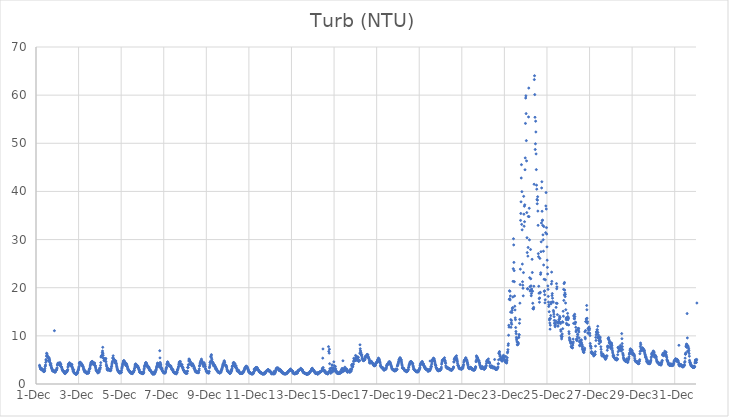
| Category | Turb (NTU) |
|---|---|
| 44896.166666666664 | 3.89 |
| 44896.177083333336 | 3.72 |
| 44896.1875 | 3.53 |
| 44896.197916666664 | 3.43 |
| 44896.208333333336 | 3.12 |
| 44896.21875 | 3.24 |
| 44896.229166666664 | 3.12 |
| 44896.239583333336 | 3.1 |
| 44896.25 | 3.03 |
| 44896.260416666664 | 3.12 |
| 44896.270833333336 | 3.23 |
| 44896.28125 | 2.91 |
| 44896.291666666664 | 2.94 |
| 44896.302083333336 | 2.89 |
| 44896.3125 | 2.82 |
| 44896.322916666664 | 2.93 |
| 44896.333333333336 | 2.72 |
| 44896.34375 | 2.73 |
| 44896.354166666664 | 2.88 |
| 44896.364583333336 | 2.58 |
| 44896.375 | 2.55 |
| 44896.385416666664 | 2.61 |
| 44896.395833333336 | 2.65 |
| 44896.40625 | 2.84 |
| 44896.416666666664 | 3.18 |
| 44896.427083333336 | 3.62 |
| 44896.4375 | 3.74 |
| 44896.447916666664 | 3.96 |
| 44896.458333333336 | 4.49 |
| 44896.46875 | 5.09 |
| 44896.479166666664 | 4.84 |
| 44896.489583333336 | 5.8 |
| 44896.5 | 6.39 |
| 44896.510416666664 | 6.29 |
| 44896.520833333336 | 6.04 |
| 44896.53125 | 5.77 |
| 44896.541666666664 | 5.73 |
| 44896.552083333336 | 5.62 |
| 44896.5625 | 5.45 |
| 44896.572916666664 | 5.65 |
| 44896.583333333336 | 4.84 |
| 44896.59375 | 4.83 |
| 44896.604166666664 | 5.42 |
| 44896.614583333336 | 4.96 |
| 44896.625 | 5.35 |
| 44896.635416666664 | 4.68 |
| 44896.645833333336 | 4.97 |
| 44896.65625 | 4.46 |
| 44896.666666666664 | 4.11 |
| 44896.677083333336 | 3.85 |
| 44896.6875 | 3.99 |
| 44896.697916666664 | 4.23 |
| 44896.708333333336 | 3.88 |
| 44896.71875 | 3.51 |
| 44896.729166666664 | 3.44 |
| 44896.739583333336 | 3.22 |
| 44896.75 | 3.14 |
| 44896.760416666664 | 2.95 |
| 44896.770833333336 | 2.77 |
| 44896.78125 | 2.76 |
| 44896.791666666664 | 2.78 |
| 44896.802083333336 | 2.67 |
| 44896.8125 | 2.68 |
| 44896.822916666664 | 2.71 |
| 44896.833333333336 | 2.61 |
| 44896.84375 | 2.66 |
| 44896.854166666664 | 2.75 |
| 44896.864583333336 | 11.07 |
| 44896.875 | 2.53 |
| 44896.885416666664 | 2.49 |
| 44896.895833333336 | 2.47 |
| 44896.90625 | 2.51 |
| 44896.916666666664 | 2.59 |
| 44896.927083333336 | 2.76 |
| 44896.9375 | 2.9 |
| 44896.947916666664 | 2.87 |
| 44896.958333333336 | 2.88 |
| 44896.96875 | 2.99 |
| 44896.979166666664 | 3.18 |
| 44896.989583333336 | 3.36 |
| 44897.0 | 3.94 |
| 44897.010416666664 | 3.99 |
| 44897.020833333336 | 4.11 |
| 44897.03125 | 4.28 |
| 44897.041666666664 | 4.37 |
| 44897.052083333336 | 4.18 |
| 44897.0625 | 4.16 |
| 44897.072916666664 | 4.28 |
| 44897.083333333336 | 4.22 |
| 44897.09375 | 4.22 |
| 44897.104166666664 | 3.89 |
| 44897.114583333336 | 4.13 |
| 44897.125 | 4.45 |
| 44897.135416666664 | 4.07 |
| 44897.145833333336 | 4 |
| 44897.15625 | 4.2 |
| 44897.166666666664 | 4.03 |
| 44897.177083333336 | 3.63 |
| 44897.1875 | 3.6 |
| 44897.197916666664 | 3.51 |
| 44897.208333333336 | 3.49 |
| 44897.21875 | 3.23 |
| 44897.229166666664 | 3.01 |
| 44897.239583333336 | 2.92 |
| 44897.25 | 2.78 |
| 44897.260416666664 | 2.73 |
| 44897.270833333336 | 2.73 |
| 44897.28125 | 2.72 |
| 44897.291666666664 | 2.7 |
| 44897.302083333336 | 2.56 |
| 44897.3125 | 2.58 |
| 44897.322916666664 | 2.41 |
| 44897.333333333336 | 2.35 |
| 44897.34375 | 2.22 |
| 44897.354166666664 | 2.29 |
| 44897.364583333336 | 2.13 |
| 44897.375 | 2.55 |
| 44897.385416666664 | 2.43 |
| 44897.395833333336 | 2.35 |
| 44897.40625 | 2.33 |
| 44897.416666666664 | 2.41 |
| 44897.427083333336 | 2.54 |
| 44897.4375 | 2.55 |
| 44897.447916666664 | 2.65 |
| 44897.458333333336 | 2.57 |
| 44897.46875 | 2.8 |
| 44897.479166666664 | 2.84 |
| 44897.489583333336 | 3 |
| 44897.5 | 3.51 |
| 44897.510416666664 | 3.7 |
| 44897.520833333336 | 4.03 |
| 44897.53125 | 4.15 |
| 44897.541666666664 | 4.15 |
| 44897.552083333336 | 4.23 |
| 44897.5625 | 4.07 |
| 44897.572916666664 | 4.43 |
| 44897.583333333336 | 4.02 |
| 44897.59375 | 4.09 |
| 44897.604166666664 | 4.05 |
| 44897.614583333336 | 3.95 |
| 44897.625 | 3.81 |
| 44897.635416666664 | 4.21 |
| 44897.645833333336 | 3.8 |
| 44897.65625 | 4.03 |
| 44897.666666666664 | 3.97 |
| 44897.677083333336 | 3.9 |
| 44897.6875 | 4.05 |
| 44897.697916666664 | 3.5 |
| 44897.708333333336 | 3.5 |
| 44897.71875 | 3.28 |
| 44897.729166666664 | 3.04 |
| 44897.739583333336 | 2.87 |
| 44897.75 | 2.62 |
| 44897.760416666664 | 2.64 |
| 44897.770833333336 | 2.98 |
| 44897.78125 | 2.42 |
| 44897.791666666664 | 2.27 |
| 44897.802083333336 | 2.32 |
| 44897.8125 | 2.25 |
| 44897.822916666664 | 2.2 |
| 44897.833333333336 | 2.16 |
| 44897.84375 | 2.17 |
| 44897.854166666664 | 2.11 |
| 44897.864583333336 | 2.05 |
| 44897.875 | 2.16 |
| 44897.885416666664 | 2.03 |
| 44897.895833333336 | 1.98 |
| 44897.90625 | 2.34 |
| 44897.916666666664 | 2.24 |
| 44897.927083333336 | 2.17 |
| 44897.9375 | 2.25 |
| 44897.947916666664 | 2.37 |
| 44897.958333333336 | 2.44 |
| 44897.96875 | 2.71 |
| 44897.979166666664 | 2.88 |
| 44897.989583333336 | 2.91 |
| 44898.0 | 3.11 |
| 44898.010416666664 | 3.37 |
| 44898.020833333336 | 3.66 |
| 44898.03125 | 4.19 |
| 44898.041666666664 | 4.45 |
| 44898.052083333336 | 4.44 |
| 44898.0625 | 4.36 |
| 44898.072916666664 | 4.54 |
| 44898.083333333336 | 4.32 |
| 44898.09375 | 4.37 |
| 44898.104166666664 | 4.39 |
| 44898.114583333336 | 4.22 |
| 44898.125 | 4.3 |
| 44898.135416666664 | 3.86 |
| 44898.145833333336 | 3.86 |
| 44898.15625 | 4.06 |
| 44898.166666666664 | 4.06 |
| 44898.177083333336 | 3.8 |
| 44898.1875 | 3.76 |
| 44898.197916666664 | 3.74 |
| 44898.208333333336 | 3.61 |
| 44898.21875 | 3.5 |
| 44898.229166666664 | 3.28 |
| 44898.239583333336 | 2.99 |
| 44898.25 | 3.11 |
| 44898.260416666664 | 2.8 |
| 44898.270833333336 | 2.68 |
| 44898.28125 | 2.54 |
| 44898.291666666664 | 2.51 |
| 44898.302083333336 | 2.78 |
| 44898.3125 | 2.58 |
| 44898.322916666664 | 2.54 |
| 44898.333333333336 | 2.44 |
| 44898.34375 | 2.39 |
| 44898.354166666664 | 2.48 |
| 44898.364583333336 | 2.27 |
| 44898.375 | 2.27 |
| 44898.385416666664 | 2.21 |
| 44898.395833333336 | 2.36 |
| 44898.40625 | 2.25 |
| 44898.416666666664 | 2.49 |
| 44898.427083333336 | 2.31 |
| 44898.4375 | 2.32 |
| 44898.447916666664 | 2.37 |
| 44898.458333333336 | 2.27 |
| 44898.46875 | 2.29 |
| 44898.479166666664 | 2.58 |
| 44898.489583333336 | 2.69 |
| 44898.5 | 3.01 |
| 44898.510416666664 | 3.1 |
| 44898.520833333336 | 3.2 |
| 44898.53125 | 3.27 |
| 44898.541666666664 | 3.54 |
| 44898.552083333336 | 3.84 |
| 44898.5625 | 4.02 |
| 44898.572916666664 | 4.24 |
| 44898.583333333336 | 4.47 |
| 44898.59375 | 4.54 |
| 44898.604166666664 | 4.39 |
| 44898.614583333336 | 4.51 |
| 44898.625 | 4.56 |
| 44898.635416666664 | 4.71 |
| 44898.645833333336 | 4.61 |
| 44898.65625 | 4.62 |
| 44898.666666666664 | 4.29 |
| 44898.677083333336 | 4.12 |
| 44898.6875 | 4.18 |
| 44898.697916666664 | 4.21 |
| 44898.708333333336 | 4.19 |
| 44898.71875 | 4.2 |
| 44898.729166666664 | 4.18 |
| 44898.739583333336 | 4.29 |
| 44898.75 | 4.39 |
| 44898.760416666664 | 3.83 |
| 44898.770833333336 | 3.84 |
| 44898.78125 | 3.81 |
| 44898.791666666664 | 3.57 |
| 44898.802083333336 | 3.35 |
| 44898.8125 | 3.11 |
| 44898.822916666664 | 2.88 |
| 44898.833333333336 | 2.87 |
| 44898.84375 | 2.75 |
| 44898.854166666664 | 2.77 |
| 44898.864583333336 | 2.58 |
| 44898.875 | 2.64 |
| 44898.885416666664 | 2.48 |
| 44898.895833333336 | 2.46 |
| 44898.90625 | 2.28 |
| 44898.916666666664 | 2.49 |
| 44898.927083333336 | 2.72 |
| 44898.9375 | 2.43 |
| 44898.947916666664 | 2.49 |
| 44898.958333333336 | 2.47 |
| 44898.96875 | 2.55 |
| 44898.979166666664 | 3.06 |
| 44898.989583333336 | 3.25 |
| 44899.0 | 2.98 |
| 44899.010416666664 | 3.34 |
| 44899.020833333336 | 3.39 |
| 44899.03125 | 3.87 |
| 44899.041666666664 | 4.44 |
| 44899.052083333336 | 5.6 |
| 44899.0625 | 5.65 |
| 44899.072916666664 | 5.83 |
| 44899.083333333336 | 5.86 |
| 44899.09375 | 5.94 |
| 44899.104166666664 | 5.93 |
| 44899.114583333336 | 6.51 |
| 44899.125 | 6.85 |
| 44899.135416666664 | 7.62 |
| 44899.145833333336 | 6.39 |
| 44899.15625 | 5.97 |
| 44899.166666666664 | 5.41 |
| 44899.177083333336 | 5.34 |
| 44899.1875 | 5.26 |
| 44899.197916666664 | 4.87 |
| 44899.208333333336 | 4.92 |
| 44899.21875 | 5.21 |
| 44899.229166666664 | 5.1 |
| 44899.239583333336 | 4.93 |
| 44899.25 | 4.74 |
| 44899.260416666664 | 5.09 |
| 44899.270833333336 | 5.22 |
| 44899.28125 | 5.3 |
| 44899.291666666664 | 4.61 |
| 44899.302083333336 | 4.12 |
| 44899.3125 | 3.77 |
| 44899.322916666664 | 3.7 |
| 44899.333333333336 | 3.3 |
| 44899.34375 | 3.05 |
| 44899.354166666664 | 2.91 |
| 44899.364583333336 | 2.92 |
| 44899.375 | 3.07 |
| 44899.385416666664 | 3.11 |
| 44899.395833333336 | 3.22 |
| 44899.40625 | 2.99 |
| 44899.416666666664 | 2.93 |
| 44899.427083333336 | 2.93 |
| 44899.4375 | 2.85 |
| 44899.447916666664 | 2.98 |
| 44899.458333333336 | 2.83 |
| 44899.46875 | 2.9 |
| 44899.479166666664 | 2.75 |
| 44899.489583333336 | 2.83 |
| 44899.5 | 2.77 |
| 44899.510416666664 | 2.91 |
| 44899.520833333336 | 2.89 |
| 44899.53125 | 3.2 |
| 44899.541666666664 | 3.56 |
| 44899.552083333336 | 3.66 |
| 44899.5625 | 3.96 |
| 44899.572916666664 | 4.25 |
| 44899.583333333336 | 4.5 |
| 44899.59375 | 4.73 |
| 44899.604166666664 | 5.38 |
| 44899.614583333336 | 5.42 |
| 44899.625 | 5.86 |
| 44899.635416666664 | 5.33 |
| 44899.645833333336 | 5.24 |
| 44899.65625 | 5.07 |
| 44899.666666666664 | 4.94 |
| 44899.677083333336 | 5.03 |
| 44899.6875 | 4.89 |
| 44899.697916666664 | 4.91 |
| 44899.708333333336 | 4.49 |
| 44899.71875 | 4.35 |
| 44899.729166666664 | 4.7 |
| 44899.739583333336 | 4.66 |
| 44899.75 | 4.79 |
| 44899.760416666664 | 4.27 |
| 44899.770833333336 | 4.33 |
| 44899.78125 | 3.94 |
| 44899.791666666664 | 3.64 |
| 44899.802083333336 | 3.44 |
| 44899.8125 | 3.16 |
| 44899.822916666664 | 3.01 |
| 44899.833333333336 | 2.95 |
| 44899.84375 | 2.76 |
| 44899.854166666664 | 2.68 |
| 44899.864583333336 | 2.71 |
| 44899.875 | 2.64 |
| 44899.885416666664 | 2.48 |
| 44899.895833333336 | 2.48 |
| 44899.90625 | 2.56 |
| 44899.916666666664 | 2.33 |
| 44899.927083333336 | 2.28 |
| 44899.9375 | 2.35 |
| 44899.947916666664 | 2.49 |
| 44899.958333333336 | 2.32 |
| 44899.96875 | 2.55 |
| 44899.979166666664 | 2.41 |
| 44899.989583333336 | 2.31 |
| 44900.0 | 2.38 |
| 44900.010416666664 | 2.48 |
| 44900.020833333336 | 2.87 |
| 44900.03125 | 3.24 |
| 44900.041666666664 | 3.46 |
| 44900.052083333336 | 3.65 |
| 44900.0625 | 3.93 |
| 44900.072916666664 | 4.14 |
| 44900.083333333336 | 4.24 |
| 44900.09375 | 4.47 |
| 44900.104166666664 | 4.73 |
| 44900.114583333336 | 4.76 |
| 44900.125 | 4.88 |
| 44900.135416666664 | 4.62 |
| 44900.145833333336 | 4.76 |
| 44900.15625 | 4.52 |
| 44900.166666666664 | 4.59 |
| 44900.177083333336 | 4.33 |
| 44900.1875 | 4.24 |
| 44900.197916666664 | 4.43 |
| 44900.208333333336 | 4.03 |
| 44900.21875 | 3.84 |
| 44900.229166666664 | 3.85 |
| 44900.239583333336 | 3.96 |
| 44900.25 | 4.23 |
| 44900.260416666664 | 4.01 |
| 44900.270833333336 | 3.82 |
| 44900.28125 | 3.67 |
| 44900.291666666664 | 3.57 |
| 44900.302083333336 | 3.39 |
| 44900.3125 | 3.18 |
| 44900.322916666664 | 2.98 |
| 44900.333333333336 | 3.04 |
| 44900.34375 | 2.95 |
| 44900.354166666664 | 2.9 |
| 44900.364583333336 | 2.76 |
| 44900.375 | 2.62 |
| 44900.385416666664 | 2.69 |
| 44900.395833333336 | 2.6 |
| 44900.40625 | 2.66 |
| 44900.416666666664 | 2.51 |
| 44900.427083333336 | 2.42 |
| 44900.4375 | 2.32 |
| 44900.447916666664 | 2.28 |
| 44900.458333333336 | 2.46 |
| 44900.46875 | 2.31 |
| 44900.479166666664 | 2.21 |
| 44900.489583333336 | 2.29 |
| 44900.5 | 2.24 |
| 44900.510416666664 | 2.38 |
| 44900.520833333336 | 2.16 |
| 44900.53125 | 2.17 |
| 44900.541666666664 | 2.37 |
| 44900.552083333336 | 2.29 |
| 44900.5625 | 2.44 |
| 44900.572916666664 | 2.51 |
| 44900.583333333336 | 2.52 |
| 44900.59375 | 2.68 |
| 44900.604166666664 | 2.82 |
| 44900.614583333336 | 2.8 |
| 44900.625 | 3.17 |
| 44900.635416666664 | 3.33 |
| 44900.645833333336 | 3.7 |
| 44900.65625 | 3.95 |
| 44900.666666666664 | 4.03 |
| 44900.677083333336 | 4.15 |
| 44900.6875 | 4.15 |
| 44900.697916666664 | 4.04 |
| 44900.708333333336 | 4.03 |
| 44900.71875 | 3.82 |
| 44900.729166666664 | 3.84 |
| 44900.739583333336 | 3.68 |
| 44900.75 | 3.85 |
| 44900.760416666664 | 3.51 |
| 44900.770833333336 | 3.53 |
| 44900.78125 | 3.51 |
| 44900.791666666664 | 3.69 |
| 44900.802083333336 | 3.39 |
| 44900.8125 | 3.4 |
| 44900.822916666664 | 3.22 |
| 44900.833333333336 | 2.98 |
| 44900.84375 | 2.97 |
| 44900.854166666664 | 2.84 |
| 44900.864583333336 | 2.55 |
| 44900.875 | 2.45 |
| 44900.885416666664 | 2.41 |
| 44900.895833333336 | 2.37 |
| 44900.90625 | 2.36 |
| 44900.916666666664 | 2.31 |
| 44900.927083333336 | 2.36 |
| 44900.9375 | 2.37 |
| 44900.947916666664 | 2.29 |
| 44900.958333333336 | 2.35 |
| 44900.96875 | 2.25 |
| 44900.979166666664 | 2.39 |
| 44900.989583333336 | 2.15 |
| 44901.0 | 2.26 |
| 44901.010416666664 | 2.22 |
| 44901.020833333336 | 2.14 |
| 44901.03125 | 2.15 |
| 44901.041666666664 | 2.19 |
| 44901.052083333336 | 2.57 |
| 44901.0625 | 2.42 |
| 44901.072916666664 | 2.93 |
| 44901.083333333336 | 3.2 |
| 44901.09375 | 3.55 |
| 44901.104166666664 | 3.76 |
| 44901.114583333336 | 3.82 |
| 44901.125 | 3.94 |
| 44901.135416666664 | 4.09 |
| 44901.145833333336 | 4.34 |
| 44901.15625 | 4.45 |
| 44901.166666666664 | 4.41 |
| 44901.177083333336 | 4.33 |
| 44901.1875 | 4.26 |
| 44901.197916666664 | 4.17 |
| 44901.208333333336 | 3.88 |
| 44901.21875 | 3.76 |
| 44901.229166666664 | 3.87 |
| 44901.239583333336 | 3.81 |
| 44901.25 | 3.42 |
| 44901.260416666664 | 3.59 |
| 44901.270833333336 | 3.51 |
| 44901.28125 | 3.53 |
| 44901.291666666664 | 3.57 |
| 44901.302083333336 | 3.45 |
| 44901.3125 | 3.33 |
| 44901.322916666664 | 3.01 |
| 44901.333333333336 | 3.07 |
| 44901.34375 | 2.83 |
| 44901.354166666664 | 2.78 |
| 44901.364583333336 | 2.91 |
| 44901.375 | 2.81 |
| 44901.385416666664 | 2.77 |
| 44901.395833333336 | 2.63 |
| 44901.40625 | 2.63 |
| 44901.416666666664 | 2.49 |
| 44901.427083333336 | 2.39 |
| 44901.4375 | 2.36 |
| 44901.447916666664 | 2.3 |
| 44901.458333333336 | 2.36 |
| 44901.46875 | 2.21 |
| 44901.479166666664 | 2.16 |
| 44901.489583333336 | 2.01 |
| 44901.5 | 2.11 |
| 44901.510416666664 | 2.28 |
| 44901.520833333336 | 2.11 |
| 44901.53125 | 2.44 |
| 44901.541666666664 | 2.16 |
| 44901.552083333336 | 2.07 |
| 44901.5625 | 2.11 |
| 44901.572916666664 | 2.22 |
| 44901.583333333336 | 2.28 |
| 44901.59375 | 2.43 |
| 44901.604166666664 | 2.49 |
| 44901.614583333336 | 2.64 |
| 44901.625 | 2.87 |
| 44901.635416666664 | 2.85 |
| 44901.645833333336 | 3.05 |
| 44901.65625 | 3.32 |
| 44901.666666666664 | 3.53 |
| 44901.677083333336 | 3.61 |
| 44901.6875 | 3.88 |
| 44901.697916666664 | 4.17 |
| 44901.708333333336 | 4.34 |
| 44901.71875 | 4.27 |
| 44901.729166666664 | 4.3 |
| 44901.739583333336 | 4.1 |
| 44901.75 | 4.05 |
| 44901.760416666664 | 3.95 |
| 44901.770833333336 | 3.86 |
| 44901.78125 | 3.86 |
| 44901.791666666664 | 3.71 |
| 44901.802083333336 | 3.47 |
| 44901.8125 | 6.91 |
| 44901.822916666664 | 5.42 |
| 44901.833333333336 | 4.49 |
| 44901.84375 | 4.26 |
| 44901.854166666664 | 4.02 |
| 44901.864583333336 | 3.94 |
| 44901.875 | 3.52 |
| 44901.885416666664 | 3.07 |
| 44901.895833333336 | 3.34 |
| 44901.90625 | 3.06 |
| 44901.916666666664 | 3.17 |
| 44901.927083333336 | 2.77 |
| 44901.9375 | 2.74 |
| 44901.947916666664 | 2.78 |
| 44901.958333333336 | 2.58 |
| 44901.96875 | 2.55 |
| 44901.979166666664 | 2.45 |
| 44901.989583333336 | 2.34 |
| 44902.0 | 2.37 |
| 44902.010416666664 | 2.35 |
| 44902.020833333336 | 2.27 |
| 44902.03125 | 2.34 |
| 44902.041666666664 | 2.38 |
| 44902.052083333336 | 2.28 |
| 44902.0625 | 2.38 |
| 44902.072916666664 | 2.32 |
| 44902.083333333336 | 2.53 |
| 44902.09375 | 2.71 |
| 44902.104166666664 | 3.04 |
| 44902.114583333336 | 3.18 |
| 44902.125 | 3.42 |
| 44902.135416666664 | 3.47 |
| 44902.145833333336 | 4.01 |
| 44902.15625 | 4.19 |
| 44902.166666666664 | 4.25 |
| 44902.177083333336 | 4.55 |
| 44902.1875 | 4.59 |
| 44902.197916666664 | 4.48 |
| 44902.208333333336 | 4.28 |
| 44902.21875 | 4.16 |
| 44902.229166666664 | 3.88 |
| 44902.239583333336 | 3.84 |
| 44902.25 | 3.8 |
| 44902.260416666664 | 3.85 |
| 44902.270833333336 | 3.87 |
| 44902.28125 | 3.79 |
| 44902.291666666664 | 3.76 |
| 44902.302083333336 | 3.76 |
| 44902.3125 | 3.59 |
| 44902.322916666664 | 3.73 |
| 44902.333333333336 | 3.74 |
| 44902.34375 | 3.55 |
| 44902.354166666664 | 3.44 |
| 44902.364583333336 | 3.21 |
| 44902.375 | 3.09 |
| 44902.385416666664 | 2.96 |
| 44902.395833333336 | 3.13 |
| 44902.40625 | 2.97 |
| 44902.416666666664 | 2.99 |
| 44902.427083333336 | 2.99 |
| 44902.4375 | 2.76 |
| 44902.447916666664 | 2.59 |
| 44902.458333333336 | 2.52 |
| 44902.46875 | 2.41 |
| 44902.479166666664 | 2.4 |
| 44902.489583333336 | 2.34 |
| 44902.5 | 2.26 |
| 44902.510416666664 | 2.28 |
| 44902.520833333336 | 2.41 |
| 44902.53125 | 2.29 |
| 44902.541666666664 | 2.24 |
| 44902.552083333336 | 2.33 |
| 44902.5625 | 2.18 |
| 44902.572916666664 | 2.22 |
| 44902.583333333336 | 2.1 |
| 44902.59375 | 2.15 |
| 44902.604166666664 | 2.25 |
| 44902.614583333336 | 2.36 |
| 44902.625 | 2.35 |
| 44902.635416666664 | 2.71 |
| 44902.645833333336 | 2.96 |
| 44902.65625 | 2.95 |
| 44902.666666666664 | 3.13 |
| 44902.677083333336 | 3.31 |
| 44902.6875 | 3.53 |
| 44902.697916666664 | 3.67 |
| 44902.708333333336 | 4.05 |
| 44902.71875 | 4.32 |
| 44902.729166666664 | 4.4 |
| 44902.739583333336 | 4.61 |
| 44902.75 | 4.57 |
| 44902.760416666664 | 4.44 |
| 44902.770833333336 | 4.36 |
| 44902.78125 | 4.68 |
| 44902.791666666664 | 4.19 |
| 44902.802083333336 | 3.99 |
| 44902.8125 | 3.84 |
| 44902.822916666664 | 3.8 |
| 44902.833333333336 | 4.02 |
| 44902.84375 | 4 |
| 44902.854166666664 | 4.03 |
| 44902.864583333336 | 3.7 |
| 44902.875 | 3.39 |
| 44902.885416666664 | 3.47 |
| 44902.895833333336 | 3.37 |
| 44902.90625 | 3.33 |
| 44902.916666666664 | 3.02 |
| 44902.927083333336 | 2.94 |
| 44902.9375 | 2.79 |
| 44902.947916666664 | 2.78 |
| 44902.958333333336 | 2.74 |
| 44902.96875 | 2.56 |
| 44902.979166666664 | 2.52 |
| 44902.989583333336 | 2.52 |
| 44903.0 | 2.32 |
| 44903.010416666664 | 2.5 |
| 44903.020833333336 | 2.35 |
| 44903.03125 | 2.34 |
| 44903.041666666664 | 2.25 |
| 44903.052083333336 | 2.27 |
| 44903.0625 | 2.2 |
| 44903.072916666664 | 2.45 |
| 44903.083333333336 | 2.27 |
| 44903.09375 | 2.21 |
| 44903.104166666664 | 2.59 |
| 44903.114583333336 | 2.69 |
| 44903.125 | 3.42 |
| 44903.135416666664 | 3.47 |
| 44903.145833333336 | 3.41 |
| 44903.15625 | 4.01 |
| 44903.166666666664 | 3.98 |
| 44903.177083333336 | 4.78 |
| 44903.1875 | 5.21 |
| 44903.197916666664 | 5.1 |
| 44903.208333333336 | 4.98 |
| 44903.21875 | 4.82 |
| 44903.229166666664 | 4.67 |
| 44903.239583333336 | 4.59 |
| 44903.25 | 4.66 |
| 44903.260416666664 | 4.23 |
| 44903.270833333336 | 4.08 |
| 44903.28125 | 4.17 |
| 44903.291666666664 | 4.21 |
| 44903.302083333336 | 4.12 |
| 44903.3125 | 4.11 |
| 44903.322916666664 | 3.78 |
| 44903.333333333336 | 3.76 |
| 44903.34375 | 3.9 |
| 44903.354166666664 | 4.24 |
| 44903.364583333336 | 3.81 |
| 44903.375 | 4.02 |
| 44903.385416666664 | 3.8 |
| 44903.395833333336 | 3.78 |
| 44903.40625 | 3.73 |
| 44903.416666666664 | 3.29 |
| 44903.427083333336 | 3.55 |
| 44903.4375 | 3.17 |
| 44903.447916666664 | 3.29 |
| 44903.458333333336 | 3.07 |
| 44903.46875 | 2.74 |
| 44903.479166666664 | 2.78 |
| 44903.489583333336 | 2.57 |
| 44903.5 | 2.8 |
| 44903.510416666664 | 2.49 |
| 44903.520833333336 | 2.58 |
| 44903.53125 | 2.63 |
| 44903.541666666664 | 2.54 |
| 44903.552083333336 | 2.42 |
| 44903.5625 | 2.37 |
| 44903.572916666664 | 2.4 |
| 44903.583333333336 | 2.41 |
| 44903.59375 | 2.36 |
| 44903.604166666664 | 2.38 |
| 44903.614583333336 | 2.36 |
| 44903.625 | 2.36 |
| 44903.635416666664 | 2.37 |
| 44903.645833333336 | 2.77 |
| 44903.65625 | 2.83 |
| 44903.666666666664 | 3.15 |
| 44903.677083333336 | 3.73 |
| 44903.6875 | 3.79 |
| 44903.697916666664 | 3.94 |
| 44903.708333333336 | 4.29 |
| 44903.71875 | 4.5 |
| 44903.729166666664 | 4.55 |
| 44903.739583333336 | 4.44 |
| 44903.75 | 4.84 |
| 44903.760416666664 | 4.82 |
| 44903.770833333336 | 5.17 |
| 44903.78125 | 4.88 |
| 44903.791666666664 | 4.72 |
| 44903.802083333336 | 4.63 |
| 44903.8125 | 4.43 |
| 44903.822916666664 | 4.28 |
| 44903.833333333336 | 4.07 |
| 44903.84375 | 4.19 |
| 44903.854166666664 | 4.31 |
| 44903.864583333336 | 3.64 |
| 44903.875 | 3.92 |
| 44903.885416666664 | 4.22 |
| 44903.895833333336 | 4.43 |
| 44903.90625 | 4.08 |
| 44903.916666666664 | 3.94 |
| 44903.927083333336 | 4.04 |
| 44903.9375 | 3.69 |
| 44903.947916666664 | 3.68 |
| 44903.958333333336 | 3.25 |
| 44903.96875 | 3.09 |
| 44903.979166666664 | 3.03 |
| 44903.989583333336 | 2.72 |
| 44904.0 | 2.67 |
| 44904.010416666664 | 2.69 |
| 44904.020833333336 | 2.6 |
| 44904.03125 | 2.51 |
| 44904.041666666664 | 2.38 |
| 44904.052083333336 | 2.38 |
| 44904.0625 | 2.41 |
| 44904.072916666664 | 2.32 |
| 44904.083333333336 | 2.35 |
| 44904.09375 | 2.43 |
| 44904.104166666664 | 2.42 |
| 44904.114583333336 | 2.24 |
| 44904.125 | 2.51 |
| 44904.135416666664 | 2.62 |
| 44904.145833333336 | 3.36 |
| 44904.15625 | 3.58 |
| 44904.166666666664 | 3.95 |
| 44904.177083333336 | 4.46 |
| 44904.1875 | 4.47 |
| 44904.197916666664 | 4.71 |
| 44904.208333333336 | 5.63 |
| 44904.21875 | 5.69 |
| 44904.229166666664 | 5.92 |
| 44904.239583333336 | 6.1 |
| 44904.25 | 5.37 |
| 44904.260416666664 | 5.05 |
| 44904.270833333336 | 4.65 |
| 44904.28125 | 4.65 |
| 44904.291666666664 | 4.36 |
| 44904.302083333336 | 4.16 |
| 44904.3125 | 4.22 |
| 44904.322916666664 | 4.36 |
| 44904.333333333336 | 4.26 |
| 44904.34375 | 3.77 |
| 44904.354166666664 | 3.79 |
| 44904.364583333336 | 3.82 |
| 44904.375 | 3.85 |
| 44904.385416666664 | 3.88 |
| 44904.395833333336 | 3.87 |
| 44904.40625 | 3.63 |
| 44904.416666666664 | 3.61 |
| 44904.427083333336 | 3.16 |
| 44904.4375 | 3.32 |
| 44904.447916666664 | 3.38 |
| 44904.458333333336 | 3.13 |
| 44904.46875 | 3.17 |
| 44904.479166666664 | 2.99 |
| 44904.489583333336 | 2.97 |
| 44904.5 | 2.74 |
| 44904.510416666664 | 2.8 |
| 44904.520833333336 | 2.76 |
| 44904.53125 | 2.7 |
| 44904.541666666664 | 2.62 |
| 44904.552083333336 | 2.41 |
| 44904.5625 | 2.5 |
| 44904.572916666664 | 2.49 |
| 44904.583333333336 | 2.52 |
| 44904.59375 | 2.41 |
| 44904.604166666664 | 2.45 |
| 44904.614583333336 | 2.34 |
| 44904.625 | 2.28 |
| 44904.635416666664 | 2.28 |
| 44904.645833333336 | 2.37 |
| 44904.65625 | 2.38 |
| 44904.666666666664 | 2.41 |
| 44904.677083333336 | 2.52 |
| 44904.6875 | 2.45 |
| 44904.697916666664 | 2.71 |
| 44904.708333333336 | 2.78 |
| 44904.71875 | 3.02 |
| 44904.729166666664 | 3.08 |
| 44904.739583333336 | 3.24 |
| 44904.75 | 3.41 |
| 44904.760416666664 | 3.61 |
| 44904.770833333336 | 3.91 |
| 44904.78125 | 3.97 |
| 44904.791666666664 | 4.17 |
| 44904.802083333336 | 4.22 |
| 44904.8125 | 4.18 |
| 44904.822916666664 | 4.5 |
| 44904.833333333336 | 4.61 |
| 44904.84375 | 4.84 |
| 44904.854166666664 | 4.46 |
| 44904.864583333336 | 4.52 |
| 44904.875 | 3.97 |
| 44904.885416666664 | 3.94 |
| 44904.895833333336 | 3.87 |
| 44904.90625 | 3.82 |
| 44904.916666666664 | 3.92 |
| 44904.927083333336 | 3.88 |
| 44904.9375 | 3.64 |
| 44904.947916666664 | 3.63 |
| 44904.958333333336 | 3.36 |
| 44904.96875 | 3.1 |
| 44904.979166666664 | 2.92 |
| 44904.989583333336 | 2.72 |
| 44905.0 | 2.76 |
| 44905.010416666664 | 2.66 |
| 44905.020833333336 | 2.64 |
| 44905.03125 | 2.62 |
| 44905.041666666664 | 2.44 |
| 44905.052083333336 | 2.54 |
| 44905.0625 | 2.44 |
| 44905.072916666664 | 2.34 |
| 44905.083333333336 | 2.31 |
| 44905.09375 | 2.23 |
| 44905.104166666664 | 2.24 |
| 44905.114583333336 | 2.18 |
| 44905.125 | 2.54 |
| 44905.135416666664 | 2.31 |
| 44905.145833333336 | 2.39 |
| 44905.15625 | 2.5 |
| 44905.166666666664 | 2.61 |
| 44905.177083333336 | 2.95 |
| 44905.1875 | 2.76 |
| 44905.197916666664 | 2.94 |
| 44905.208333333336 | 3.25 |
| 44905.21875 | 3.64 |
| 44905.229166666664 | 3.67 |
| 44905.239583333336 | 3.8 |
| 44905.25 | 3.87 |
| 44905.260416666664 | 4.31 |
| 44905.270833333336 | 4.44 |
| 44905.28125 | 4.33 |
| 44905.291666666664 | 4.47 |
| 44905.302083333336 | 4.34 |
| 44905.3125 | 4.01 |
| 44905.322916666664 | 4.03 |
| 44905.333333333336 | 4.01 |
| 44905.34375 | 4.23 |
| 44905.354166666664 | 3.51 |
| 44905.364583333336 | 3.7 |
| 44905.375 | 3.59 |
| 44905.385416666664 | 3.61 |
| 44905.395833333336 | 3.79 |
| 44905.40625 | 3.33 |
| 44905.416666666664 | 3.24 |
| 44905.427083333336 | 3.28 |
| 44905.4375 | 2.91 |
| 44905.447916666664 | 2.89 |
| 44905.458333333336 | 2.66 |
| 44905.46875 | 2.67 |
| 44905.479166666664 | 2.83 |
| 44905.489583333336 | 2.71 |
| 44905.5 | 2.77 |
| 44905.510416666664 | 2.88 |
| 44905.520833333336 | 2.74 |
| 44905.53125 | 2.67 |
| 44905.541666666664 | 2.51 |
| 44905.552083333336 | 2.44 |
| 44905.5625 | 2.33 |
| 44905.572916666664 | 2.29 |
| 44905.583333333336 | 2.22 |
| 44905.59375 | 2.2 |
| 44905.604166666664 | 2.18 |
| 44905.614583333336 | 2.25 |
| 44905.625 | 2.26 |
| 44905.635416666664 | 2.24 |
| 44905.645833333336 | 2.27 |
| 44905.65625 | 2.19 |
| 44905.666666666664 | 2.28 |
| 44905.677083333336 | 2.22 |
| 44905.6875 | 2.22 |
| 44905.697916666664 | 2.31 |
| 44905.708333333336 | 2.23 |
| 44905.71875 | 2.46 |
| 44905.729166666664 | 2.48 |
| 44905.739583333336 | 2.59 |
| 44905.75 | 2.55 |
| 44905.760416666664 | 2.68 |
| 44905.770833333336 | 2.75 |
| 44905.78125 | 2.93 |
| 44905.791666666664 | 2.99 |
| 44905.802083333336 | 3.33 |
| 44905.8125 | 3.17 |
| 44905.822916666664 | 3.26 |
| 44905.833333333336 | 3.34 |
| 44905.84375 | 3.5 |
| 44905.854166666664 | 3.52 |
| 44905.864583333336 | 3.71 |
| 44905.875 | 3.61 |
| 44905.885416666664 | 3.68 |
| 44905.895833333336 | 3.48 |
| 44905.90625 | 3.61 |
| 44905.916666666664 | 3.3 |
| 44905.927083333336 | 3.34 |
| 44905.9375 | 3.42 |
| 44905.947916666664 | 3.24 |
| 44905.958333333336 | 2.96 |
| 44905.96875 | 3.03 |
| 44905.979166666664 | 2.78 |
| 44905.989583333336 | 2.54 |
| 44906.0 | 2.53 |
| 44906.010416666664 | 2.45 |
| 44906.020833333336 | 2.48 |
| 44906.03125 | 2.4 |
| 44906.041666666664 | 2.44 |
| 44906.052083333336 | 2.22 |
| 44906.0625 | 2.22 |
| 44906.072916666664 | 2.31 |
| 44906.083333333336 | 2.27 |
| 44906.09375 | 2.23 |
| 44906.104166666664 | 2.11 |
| 44906.114583333336 | 2.18 |
| 44906.125 | 2.18 |
| 44906.135416666664 | 2.11 |
| 44906.145833333336 | 2.04 |
| 44906.15625 | 2.23 |
| 44906.166666666664 | 2.21 |
| 44906.177083333336 | 2.13 |
| 44906.1875 | 2.08 |
| 44906.197916666664 | 2.17 |
| 44906.208333333336 | 2.24 |
| 44906.21875 | 2.4 |
| 44906.229166666664 | 2.5 |
| 44906.239583333336 | 2.57 |
| 44906.25 | 2.96 |
| 44906.260416666664 | 3.16 |
| 44906.270833333336 | 2.84 |
| 44906.28125 | 3.12 |
| 44906.291666666664 | 3.19 |
| 44906.302083333336 | 2.88 |
| 44906.3125 | 3.26 |
| 44906.322916666664 | 3.25 |
| 44906.333333333336 | 3.45 |
| 44906.34375 | 3.43 |
| 44906.354166666664 | 3.29 |
| 44906.364583333336 | 3.16 |
| 44906.375 | 3.43 |
| 44906.385416666664 | 3.09 |
| 44906.395833333336 | 3.37 |
| 44906.40625 | 2.98 |
| 44906.416666666664 | 2.94 |
| 44906.427083333336 | 3.02 |
| 44906.4375 | 2.98 |
| 44906.447916666664 | 2.9 |
| 44906.458333333336 | 2.9 |
| 44906.46875 | 2.8 |
| 44906.479166666664 | 2.55 |
| 44906.489583333336 | 2.58 |
| 44906.5 | 2.49 |
| 44906.510416666664 | 2.42 |
| 44906.520833333336 | 2.43 |
| 44906.53125 | 2.39 |
| 44906.541666666664 | 2.49 |
| 44906.552083333336 | 2.45 |
| 44906.5625 | 2.35 |
| 44906.572916666664 | 2.3 |
| 44906.583333333336 | 2.17 |
| 44906.59375 | 2.29 |
| 44906.604166666664 | 2.21 |
| 44906.614583333336 | 2.15 |
| 44906.625 | 2.11 |
| 44906.635416666664 | 2.19 |
| 44906.645833333336 | 2.11 |
| 44906.65625 | 2.03 |
| 44906.666666666664 | 2.22 |
| 44906.677083333336 | 2.22 |
| 44906.6875 | 2.12 |
| 44906.697916666664 | 2.13 |
| 44906.708333333336 | 2.06 |
| 44906.71875 | 2.06 |
| 44906.729166666664 | 2.19 |
| 44906.739583333336 | 2.25 |
| 44906.75 | 2.22 |
| 44906.760416666664 | 2.23 |
| 44906.770833333336 | 2.52 |
| 44906.78125 | 2.34 |
| 44906.791666666664 | 2.52 |
| 44906.802083333336 | 2.56 |
| 44906.8125 | 2.54 |
| 44906.822916666664 | 2.67 |
| 44906.833333333336 | 2.72 |
| 44906.84375 | 2.83 |
| 44906.854166666664 | 2.77 |
| 44906.864583333336 | 2.8 |
| 44906.875 | 2.81 |
| 44906.885416666664 | 2.93 |
| 44906.895833333336 | 2.97 |
| 44906.90625 | 2.98 |
| 44906.916666666664 | 2.96 |
| 44906.927083333336 | 2.89 |
| 44906.9375 | 2.65 |
| 44906.947916666664 | 2.78 |
| 44906.958333333336 | 2.73 |
| 44906.96875 | 2.8 |
| 44906.979166666664 | 2.75 |
| 44906.989583333336 | 2.64 |
| 44907.0 | 2.58 |
| 44907.010416666664 | 2.49 |
| 44907.020833333336 | 2.54 |
| 44907.03125 | 2.46 |
| 44907.041666666664 | 2.34 |
| 44907.052083333336 | 2.14 |
| 44907.0625 | 2.25 |
| 44907.072916666664 | 2.17 |
| 44907.083333333336 | 2.09 |
| 44907.09375 | 2.15 |
| 44907.104166666664 | 2.18 |
| 44907.114583333336 | 2.18 |
| 44907.125 | 2.19 |
| 44907.135416666664 | 2.15 |
| 44907.145833333336 | 2.1 |
| 44907.15625 | 2.14 |
| 44907.166666666664 | 2.29 |
| 44907.177083333336 | 2.6 |
| 44907.1875 | 2.17 |
| 44907.197916666664 | 2.12 |
| 44907.208333333336 | 2.19 |
| 44907.21875 | 2.25 |
| 44907.229166666664 | 2.41 |
| 44907.239583333336 | 2.48 |
| 44907.25 | 2.64 |
| 44907.260416666664 | 2.9 |
| 44907.270833333336 | 2.84 |
| 44907.28125 | 3.15 |
| 44907.291666666664 | 3.11 |
| 44907.302083333336 | 3.32 |
| 44907.3125 | 3.29 |
| 44907.322916666664 | 3.26 |
| 44907.333333333336 | 3.29 |
| 44907.34375 | 3.34 |
| 44907.354166666664 | 3.16 |
| 44907.364583333336 | 3.25 |
| 44907.375 | 3.32 |
| 44907.385416666664 | 3.1 |
| 44907.395833333336 | 3.15 |
| 44907.40625 | 3.04 |
| 44907.416666666664 | 2.85 |
| 44907.427083333336 | 2.77 |
| 44907.4375 | 2.93 |
| 44907.447916666664 | 2.81 |
| 44907.458333333336 | 2.77 |
| 44907.46875 | 3.01 |
| 44907.479166666664 | 2.92 |
| 44907.489583333336 | 2.85 |
| 44907.5 | 2.72 |
| 44907.510416666664 | 2.66 |
| 44907.520833333336 | 2.78 |
| 44907.53125 | 2.46 |
| 44907.541666666664 | 2.54 |
| 44907.552083333336 | 2.36 |
| 44907.5625 | 2.47 |
| 44907.572916666664 | 2.27 |
| 44907.583333333336 | 2.41 |
| 44907.59375 | 2.29 |
| 44907.604166666664 | 2.33 |
| 44907.614583333336 | 2.25 |
| 44907.625 | 2.17 |
| 44907.635416666664 | 2.12 |
| 44907.645833333336 | 2.22 |
| 44907.65625 | 2.18 |
| 44907.666666666664 | 2.14 |
| 44907.677083333336 | 2.1 |
| 44907.6875 | 2.09 |
| 44907.697916666664 | 2.15 |
| 44907.708333333336 | 2.09 |
| 44907.71875 | 2.11 |
| 44907.729166666664 | 2.13 |
| 44907.739583333336 | 2.16 |
| 44907.75 | 2.12 |
| 44907.760416666664 | 2.17 |
| 44907.770833333336 | 2.16 |
| 44907.78125 | 2.24 |
| 44907.791666666664 | 2.31 |
| 44907.802083333336 | 2.37 |
| 44907.8125 | 2.31 |
| 44907.822916666664 | 2.46 |
| 44907.833333333336 | 2.51 |
| 44907.84375 | 2.55 |
| 44907.854166666664 | 2.63 |
| 44907.864583333336 | 2.67 |
| 44907.875 | 2.7 |
| 44907.885416666664 | 2.75 |
| 44907.895833333336 | 2.67 |
| 44907.90625 | 2.81 |
| 44907.916666666664 | 2.82 |
| 44907.927083333336 | 2.9 |
| 44907.9375 | 3.04 |
| 44907.947916666664 | 2.94 |
| 44907.958333333336 | 3.13 |
| 44907.96875 | 2.83 |
| 44907.979166666664 | 2.83 |
| 44907.989583333336 | 2.73 |
| 44908.0 | 2.84 |
| 44908.010416666664 | 2.76 |
| 44908.020833333336 | 2.75 |
| 44908.03125 | 2.74 |
| 44908.041666666664 | 2.61 |
| 44908.052083333336 | 2.67 |
| 44908.0625 | 2.6 |
| 44908.072916666664 | 2.22 |
| 44908.083333333336 | 2.34 |
| 44908.09375 | 2.22 |
| 44908.104166666664 | 2.28 |
| 44908.114583333336 | 2.24 |
| 44908.125 | 2.2 |
| 44908.135416666664 | 2.08 |
| 44908.145833333336 | 2.15 |
| 44908.15625 | 2.18 |
| 44908.166666666664 | 2.18 |
| 44908.177083333336 | 2.27 |
| 44908.1875 | 2.15 |
| 44908.197916666664 | 2.15 |
| 44908.208333333336 | 2.38 |
| 44908.21875 | 2.23 |
| 44908.229166666664 | 2.48 |
| 44908.239583333336 | 2.24 |
| 44908.25 | 2.28 |
| 44908.260416666664 | 2.28 |
| 44908.270833333336 | 2.29 |
| 44908.28125 | 2.32 |
| 44908.291666666664 | 2.48 |
| 44908.302083333336 | 2.67 |
| 44908.3125 | 2.75 |
| 44908.322916666664 | 2.84 |
| 44908.333333333336 | 2.74 |
| 44908.34375 | 2.83 |
| 44908.354166666664 | 2.92 |
| 44908.364583333336 | 2.88 |
| 44908.375 | 2.95 |
| 44908.385416666664 | 2.96 |
| 44908.395833333336 | 2.97 |
| 44908.40625 | 3.06 |
| 44908.416666666664 | 3.07 |
| 44908.427083333336 | 3.12 |
| 44908.4375 | 3.27 |
| 44908.447916666664 | 3.09 |
| 44908.458333333336 | 3.04 |
| 44908.46875 | 2.92 |
| 44908.479166666664 | 2.9 |
| 44908.489583333336 | 3 |
| 44908.5 | 3 |
| 44908.510416666664 | 2.81 |
| 44908.520833333336 | 2.84 |
| 44908.53125 | 2.64 |
| 44908.541666666664 | 2.56 |
| 44908.552083333336 | 2.4 |
| 44908.5625 | 2.38 |
| 44908.572916666664 | 2.41 |
| 44908.583333333336 | 2.36 |
| 44908.59375 | 2.26 |
| 44908.604166666664 | 2.37 |
| 44908.614583333336 | 2.21 |
| 44908.625 | 2.27 |
| 44908.635416666664 | 2.22 |
| 44908.645833333336 | 2.16 |
| 44908.65625 | 2.2 |
| 44908.666666666664 | 2.17 |
| 44908.677083333336 | 2.22 |
| 44908.6875 | 2.16 |
| 44908.697916666664 | 2.02 |
| 44908.708333333336 | 2.03 |
| 44908.71875 | 2 |
| 44908.729166666664 | 2.06 |
| 44908.739583333336 | 2.22 |
| 44908.75 | 2.08 |
| 44908.760416666664 | 2.09 |
| 44908.770833333336 | 2.05 |
| 44908.78125 | 2.08 |
| 44908.791666666664 | 2.13 |
| 44908.802083333336 | 2.2 |
| 44908.8125 | 2.2 |
| 44908.822916666664 | 2.25 |
| 44908.833333333336 | 2.27 |
| 44908.84375 | 2.35 |
| 44908.854166666664 | 2.47 |
| 44908.864583333336 | 2.48 |
| 44908.875 | 2.6 |
| 44908.885416666664 | 2.63 |
| 44908.895833333336 | 2.7 |
| 44908.90625 | 2.65 |
| 44908.916666666664 | 2.65 |
| 44908.927083333336 | 2.8 |
| 44908.9375 | 3.04 |
| 44908.947916666664 | 3.03 |
| 44908.958333333336 | 3.11 |
| 44908.96875 | 3.24 |
| 44908.979166666664 | 3.26 |
| 44908.989583333336 | 3.09 |
| 44909.0 | 2.98 |
| 44909.010416666664 | 2.8 |
| 44909.020833333336 | 2.94 |
| 44909.03125 | 2.92 |
| 44909.041666666664 | 2.83 |
| 44909.052083333336 | 2.81 |
| 44909.0625 | 2.69 |
| 44909.072916666664 | 2.65 |
| 44909.083333333336 | 2.53 |
| 44909.09375 | 2.49 |
| 44909.104166666664 | 2.39 |
| 44909.114583333336 | 2.24 |
| 44909.125 | 2.24 |
| 44909.135416666664 | 2.21 |
| 44909.145833333336 | 2.17 |
| 44909.15625 | 2.26 |
| 44909.166666666664 | 2.27 |
| 44909.177083333336 | 2.21 |
| 44909.1875 | 2.23 |
| 44909.197916666664 | 2.28 |
| 44909.208333333336 | 2.15 |
| 44909.21875 | 2.2 |
| 44909.229166666664 | 2 |
| 44909.239583333336 | 2.35 |
| 44909.25 | 2.32 |
| 44909.260416666664 | 2.32 |
| 44909.270833333336 | 2.22 |
| 44909.28125 | 2.29 |
| 44909.291666666664 | 2.28 |
| 44909.302083333336 | 2.39 |
| 44909.3125 | 2.32 |
| 44909.322916666664 | 2.42 |
| 44909.333333333336 | 2.5 |
| 44909.34375 | 2.48 |
| 44909.354166666664 | 2.59 |
| 44909.364583333336 | 2.57 |
| 44909.375 | 2.57 |
| 44909.385416666664 | 2.66 |
| 44909.395833333336 | 2.62 |
| 44909.40625 | 2.75 |
| 44909.416666666664 | 2.66 |
| 44909.427083333336 | 2.77 |
| 44909.4375 | 2.77 |
| 44909.447916666664 | 3.15 |
| 44909.458333333336 | 3.28 |
| 44909.46875 | 5.37 |
| 44909.479166666664 | 7.28 |
| 44909.489583333336 | 3.42 |
| 44909.5 | 2.75 |
| 44909.510416666664 | 2.72 |
| 44909.520833333336 | 2.87 |
| 44909.53125 | 2.82 |
| 44909.541666666664 | 2.84 |
| 44909.552083333336 | 2.75 |
| 44909.5625 | 2.67 |
| 44909.572916666664 | 2.57 |
| 44909.583333333336 | 2.7 |
| 44909.59375 | 2.38 |
| 44909.604166666664 | 2.28 |
| 44909.614583333336 | 2.34 |
| 44909.625 | 2.28 |
| 44909.635416666664 | 2.27 |
| 44909.645833333336 | 2.19 |
| 44909.65625 | 2.2 |
| 44909.666666666664 | 2.22 |
| 44909.677083333336 | 2.22 |
| 44909.6875 | 2.13 |
| 44909.697916666664 | 2.14 |
| 44909.708333333336 | 2.09 |
| 44909.71875 | 2.14 |
| 44909.729166666664 | 2.43 |
| 44909.739583333336 | 7.76 |
| 44909.75 | 6.78 |
| 44909.760416666664 | 2.58 |
| 44909.770833333336 | 6.41 |
| 44909.78125 | 7.22 |
| 44909.791666666664 | 4.22 |
| 44909.802083333336 | 3.17 |
| 44909.8125 | 2.88 |
| 44909.822916666664 | 2.73 |
| 44909.833333333336 | 2.46 |
| 44909.84375 | 2.23 |
| 44909.854166666664 | 2.56 |
| 44909.864583333336 | 3.24 |
| 44909.875 | 3.37 |
| 44909.885416666664 | 2.7 |
| 44909.895833333336 | 2.56 |
| 44909.90625 | 3.97 |
| 44909.916666666664 | 3.88 |
| 44909.927083333336 | 2.52 |
| 44909.9375 | 2.71 |
| 44909.947916666664 | 3.13 |
| 44909.958333333336 | 2.86 |
| 44909.96875 | 3.34 |
| 44909.979166666664 | 3.21 |
| 44909.989583333336 | 4.6 |
| 44910.0 | 3.13 |
| 44910.010416666664 | 3.81 |
| 44910.020833333336 | 2.85 |
| 44910.03125 | 2.71 |
| 44910.041666666664 | 2.76 |
| 44910.052083333336 | 2.77 |
| 44910.0625 | 3.65 |
| 44910.072916666664 | 3.19 |
| 44910.083333333336 | 2.85 |
| 44910.09375 | 2.73 |
| 44910.104166666664 | 2.68 |
| 44910.114583333336 | 2.42 |
| 44910.125 | 2.35 |
| 44910.135416666664 | 2.29 |
| 44910.145833333336 | 2.29 |
| 44910.15625 | 2.22 |
| 44910.166666666664 | 2.34 |
| 44910.177083333336 | 2.3 |
| 44910.1875 | 2.2 |
| 44910.197916666664 | 2.2 |
| 44910.208333333336 | 2.17 |
| 44910.21875 | 2.23 |
| 44910.229166666664 | 2.36 |
| 44910.239583333336 | 2.24 |
| 44910.25 | 2.33 |
| 44910.260416666664 | 2.19 |
| 44910.270833333336 | 2.51 |
| 44910.28125 | 2.35 |
| 44910.291666666664 | 2.23 |
| 44910.302083333336 | 2.4 |
| 44910.3125 | 2.43 |
| 44910.322916666664 | 2.45 |
| 44910.333333333336 | 2.87 |
| 44910.34375 | 2.43 |
| 44910.354166666664 | 2.43 |
| 44910.364583333336 | 3.02 |
| 44910.375 | 3.23 |
| 44910.385416666664 | 2.66 |
| 44910.395833333336 | 2.8 |
| 44910.40625 | 2.58 |
| 44910.416666666664 | 4.82 |
| 44910.427083333336 | 3.21 |
| 44910.4375 | 2.96 |
| 44910.447916666664 | 2.73 |
| 44910.458333333336 | 2.69 |
| 44910.46875 | 2.78 |
| 44910.479166666664 | 2.95 |
| 44910.489583333336 | 2.99 |
| 44910.5 | 2.96 |
| 44910.510416666664 | 3.5 |
| 44910.520833333336 | 2.97 |
| 44910.53125 | 3.01 |
| 44910.541666666664 | 2.94 |
| 44910.552083333336 | 2.93 |
| 44910.5625 | 3.11 |
| 44910.572916666664 | 3.13 |
| 44910.583333333336 | 2.81 |
| 44910.59375 | 3.1 |
| 44910.604166666664 | 2.6 |
| 44910.614583333336 | 2.69 |
| 44910.625 | 2.47 |
| 44910.635416666664 | 2.46 |
| 44910.645833333336 | 2.66 |
| 44910.65625 | 2.61 |
| 44910.666666666664 | 2.57 |
| 44910.677083333336 | 2.65 |
| 44910.6875 | 2.67 |
| 44910.697916666664 | 2.59 |
| 44910.708333333336 | 2.58 |
| 44910.71875 | 2.48 |
| 44910.729166666664 | 2.58 |
| 44910.739583333336 | 2.52 |
| 44910.75 | 2.45 |
| 44910.760416666664 | 2.99 |
| 44910.770833333336 | 2.79 |
| 44910.78125 | 3.09 |
| 44910.791666666664 | 2.65 |
| 44910.802083333336 | 2.7 |
| 44910.8125 | 2.94 |
| 44910.822916666664 | 3.93 |
| 44910.833333333336 | 3.11 |
| 44910.84375 | 3.68 |
| 44910.854166666664 | 4.12 |
| 44910.864583333336 | 3.67 |
| 44910.875 | 3.54 |
| 44910.885416666664 | 3.72 |
| 44910.895833333336 | 4.13 |
| 44910.90625 | 4.14 |
| 44910.916666666664 | 4.7 |
| 44910.927083333336 | 5.34 |
| 44910.9375 | 4.94 |
| 44910.947916666664 | 4.78 |
| 44910.958333333336 | 4.84 |
| 44910.96875 | 5.1 |
| 44910.979166666664 | 4.83 |
| 44910.989583333336 | 4.86 |
| 44911.0 | 5 |
| 44911.010416666664 | 5.93 |
| 44911.020833333336 | 5.18 |
| 44911.03125 | 5.43 |
| 44911.041666666664 | 5.75 |
| 44911.052083333336 | 5.52 |
| 44911.0625 | 4.94 |
| 44911.072916666664 | 5.01 |
| 44911.083333333336 | 5.22 |
| 44911.09375 | 5.37 |
| 44911.104166666664 | 5.64 |
| 44911.114583333336 | 5.45 |
| 44911.125 | 5.44 |
| 44911.135416666664 | 5.56 |
| 44911.145833333336 | 4.75 |
| 44911.15625 | 4.74 |
| 44911.166666666664 | 4.73 |
| 44911.177083333336 | 4.87 |
| 44911.1875 | 4.9 |
| 44911.197916666664 | 4.87 |
| 44911.208333333336 | 6.4 |
| 44911.21875 | 8.14 |
| 44911.229166666664 | 7.32 |
| 44911.239583333336 | 6.91 |
| 44911.25 | 6.63 |
| 44911.260416666664 | 6.17 |
| 44911.270833333336 | 6.45 |
| 44911.28125 | 6.02 |
| 44911.291666666664 | 5.92 |
| 44911.302083333336 | 6.08 |
| 44911.3125 | 5.63 |
| 44911.322916666664 | 5.3 |
| 44911.333333333336 | 5.32 |
| 44911.34375 | 5.14 |
| 44911.354166666664 | 4.98 |
| 44911.364583333336 | 4.87 |
| 44911.375 | 4.98 |
| 44911.385416666664 | 4.84 |
| 44911.395833333336 | 4.96 |
| 44911.40625 | 5.07 |
| 44911.416666666664 | 4.96 |
| 44911.427083333336 | 5.02 |
| 44911.4375 | 5.04 |
| 44911.447916666664 | 5.09 |
| 44911.458333333336 | 5.55 |
| 44911.46875 | 5.76 |
| 44911.479166666664 | 5.59 |
| 44911.489583333336 | 5.54 |
| 44911.5 | 5.57 |
| 44911.510416666664 | 5.85 |
| 44911.520833333336 | 5.85 |
| 44911.53125 | 5.89 |
| 44911.541666666664 | 5.88 |
| 44911.552083333336 | 6.14 |
| 44911.5625 | 6.14 |
| 44911.572916666664 | 5.61 |
| 44911.583333333336 | 5.65 |
| 44911.59375 | 6.04 |
| 44911.604166666664 | 5.6 |
| 44911.614583333336 | 5.57 |
| 44911.625 | 5.41 |
| 44911.635416666664 | 5.31 |
| 44911.645833333336 | 5.17 |
| 44911.65625 | 4.81 |
| 44911.666666666664 | 4.41 |
| 44911.677083333336 | 4.53 |
| 44911.6875 | 4.34 |
| 44911.697916666664 | 4.37 |
| 44911.708333333336 | 4.53 |
| 44911.71875 | 4.82 |
| 44911.729166666664 | 4.58 |
| 44911.739583333336 | 4.68 |
| 44911.75 | 4.67 |
| 44911.760416666664 | 4.64 |
| 44911.770833333336 | 4.54 |
| 44911.78125 | 4.45 |
| 44911.791666666664 | 4.44 |
| 44911.802083333336 | 4.39 |
| 44911.8125 | 4.2 |
| 44911.822916666664 | 4.18 |
| 44911.833333333336 | 4.15 |
| 44911.84375 | 4.15 |
| 44911.854166666664 | 3.96 |
| 44911.864583333336 | 3.86 |
| 44911.875 | 3.81 |
| 44911.885416666664 | 3.75 |
| 44911.895833333336 | 3.9 |
| 44911.90625 | 3.89 |
| 44911.916666666664 | 3.82 |
| 44911.927083333336 | 3.82 |
| 44911.9375 | 3.9 |
| 44911.947916666664 | 4.15 |
| 44911.958333333336 | 4.22 |
| 44911.96875 | 4.37 |
| 44911.979166666664 | 4.38 |
| 44911.989583333336 | 4.47 |
| 44912.0 | 4.44 |
| 44912.010416666664 | 4.55 |
| 44912.020833333336 | 4.66 |
| 44912.03125 | 4.76 |
| 44912.041666666664 | 4.88 |
| 44912.052083333336 | 4.99 |
| 44912.0625 | 5.07 |
| 44912.072916666664 | 5.16 |
| 44912.083333333336 | 5.39 |
| 44912.09375 | 5.11 |
| 44912.104166666664 | 4.66 |
| 44912.114583333336 | 5.22 |
| 44912.125 | 5.06 |
| 44912.135416666664 | 4.8 |
| 44912.145833333336 | 4.56 |
| 44912.15625 | 4.57 |
| 44912.166666666664 | 4.34 |
| 44912.177083333336 | 3.83 |
| 44912.1875 | 3.92 |
| 44912.197916666664 | 3.63 |
| 44912.208333333336 | 3.64 |
| 44912.21875 | 3.47 |
| 44912.229166666664 | 3.48 |
| 44912.239583333336 | 3.52 |
| 44912.25 | 3.37 |
| 44912.260416666664 | 3.35 |
| 44912.270833333336 | 3.24 |
| 44912.28125 | 3.35 |
| 44912.291666666664 | 3.29 |
| 44912.302083333336 | 3.36 |
| 44912.3125 | 3.04 |
| 44912.322916666664 | 3.17 |
| 44912.333333333336 | 3.02 |
| 44912.34375 | 2.84 |
| 44912.354166666664 | 3.1 |
| 44912.364583333336 | 2.95 |
| 44912.375 | 3.04 |
| 44912.385416666664 | 2.96 |
| 44912.395833333336 | 3.05 |
| 44912.40625 | 3.08 |
| 44912.416666666664 | 3.03 |
| 44912.427083333336 | 3.14 |
| 44912.4375 | 3.14 |
| 44912.447916666664 | 3.15 |
| 44912.458333333336 | 3.47 |
| 44912.46875 | 3.8 |
| 44912.479166666664 | 3.78 |
| 44912.489583333336 | 4.02 |
| 44912.5 | 4.01 |
| 44912.510416666664 | 4.18 |
| 44912.520833333336 | 4.07 |
| 44912.53125 | 4.13 |
| 44912.541666666664 | 4.15 |
| 44912.552083333336 | 4.24 |
| 44912.5625 | 4.32 |
| 44912.572916666664 | 4.54 |
| 44912.583333333336 | 4.61 |
| 44912.59375 | 4.54 |
| 44912.604166666664 | 4.35 |
| 44912.614583333336 | 4.64 |
| 44912.625 | 4.43 |
| 44912.635416666664 | 4.45 |
| 44912.645833333336 | 4.13 |
| 44912.65625 | 4.16 |
| 44912.666666666664 | 3.96 |
| 44912.677083333336 | 3.89 |
| 44912.6875 | 3.7 |
| 44912.697916666664 | 3.56 |
| 44912.708333333336 | 3.35 |
| 44912.71875 | 3.2 |
| 44912.729166666664 | 3.09 |
| 44912.739583333336 | 3.09 |
| 44912.75 | 3.01 |
| 44912.760416666664 | 3.06 |
| 44912.770833333336 | 2.92 |
| 44912.78125 | 3 |
| 44912.791666666664 | 2.86 |
| 44912.802083333336 | 2.97 |
| 44912.8125 | 2.76 |
| 44912.822916666664 | 2.85 |
| 44912.833333333336 | 2.89 |
| 44912.84375 | 2.77 |
| 44912.854166666664 | 2.69 |
| 44912.864583333336 | 2.73 |
| 44912.875 | 2.87 |
| 44912.885416666664 | 2.8 |
| 44912.895833333336 | 3.08 |
| 44912.90625 | 2.82 |
| 44912.916666666664 | 2.89 |
| 44912.927083333336 | 2.95 |
| 44912.9375 | 3.07 |
| 44912.947916666664 | 3.06 |
| 44912.958333333336 | 3.07 |
| 44912.96875 | 3.72 |
| 44912.979166666664 | 3.85 |
| 44912.989583333336 | 3.88 |
| 44913.0 | 4.08 |
| 44913.010416666664 | 4.22 |
| 44913.020833333336 | 4.41 |
| 44913.03125 | 4.63 |
| 44913.041666666664 | 4.79 |
| 44913.052083333336 | 5.08 |
| 44913.0625 | 5.14 |
| 44913.072916666664 | 5.19 |
| 44913.083333333336 | 5.19 |
| 44913.09375 | 5.47 |
| 44913.104166666664 | 5.33 |
| 44913.114583333336 | 5.36 |
| 44913.125 | 5.06 |
| 44913.135416666664 | 5.05 |
| 44913.145833333336 | 5.06 |
| 44913.15625 | 4.93 |
| 44913.166666666664 | 4.6 |
| 44913.177083333336 | 4.33 |
| 44913.1875 | 4.03 |
| 44913.197916666664 | 3.79 |
| 44913.208333333336 | 3.34 |
| 44913.21875 | 3.33 |
| 44913.229166666664 | 3.3 |
| 44913.239583333336 | 3.31 |
| 44913.25 | 3.29 |
| 44913.260416666664 | 3.3 |
| 44913.270833333336 | 3.17 |
| 44913.28125 | 3.04 |
| 44913.291666666664 | 2.98 |
| 44913.302083333336 | 3 |
| 44913.3125 | 2.77 |
| 44913.322916666664 | 2.86 |
| 44913.333333333336 | 2.74 |
| 44913.34375 | 2.78 |
| 44913.354166666664 | 2.76 |
| 44913.364583333336 | 2.78 |
| 44913.375 | 2.86 |
| 44913.385416666664 | 2.7 |
| 44913.395833333336 | 2.53 |
| 44913.40625 | 2.7 |
| 44913.416666666664 | 2.65 |
| 44913.427083333336 | 2.62 |
| 44913.4375 | 2.62 |
| 44913.447916666664 | 2.67 |
| 44913.458333333336 | 2.8 |
| 44913.46875 | 2.88 |
| 44913.479166666664 | 2.96 |
| 44913.489583333336 | 3.03 |
| 44913.5 | 3.42 |
| 44913.510416666664 | 3.52 |
| 44913.520833333336 | 3.81 |
| 44913.53125 | 3.99 |
| 44913.541666666664 | 4.06 |
| 44913.552083333336 | 4.24 |
| 44913.5625 | 4.4 |
| 44913.572916666664 | 4.55 |
| 44913.583333333336 | 4.62 |
| 44913.59375 | 4.63 |
| 44913.604166666664 | 4.62 |
| 44913.614583333336 | 4.58 |
| 44913.625 | 4.66 |
| 44913.635416666664 | 4.41 |
| 44913.645833333336 | 4.52 |
| 44913.65625 | 4.37 |
| 44913.666666666664 | 4.4 |
| 44913.677083333336 | 4.27 |
| 44913.6875 | 4.23 |
| 44913.697916666664 | 4.19 |
| 44913.708333333336 | 3.82 |
| 44913.71875 | 3.64 |
| 44913.729166666664 | 3.39 |
| 44913.739583333336 | 3.11 |
| 44913.75 | 3.09 |
| 44913.760416666664 | 3.03 |
| 44913.770833333336 | 2.96 |
| 44913.78125 | 3 |
| 44913.791666666664 | 2.85 |
| 44913.802083333336 | 2.77 |
| 44913.8125 | 2.77 |
| 44913.822916666664 | 2.73 |
| 44913.833333333336 | 2.7 |
| 44913.84375 | 2.6 |
| 44913.854166666664 | 2.7 |
| 44913.864583333336 | 2.61 |
| 44913.875 | 2.57 |
| 44913.885416666664 | 2.51 |
| 44913.895833333336 | 2.55 |
| 44913.90625 | 2.67 |
| 44913.916666666664 | 2.73 |
| 44913.927083333336 | 2.49 |
| 44913.9375 | 2.58 |
| 44913.947916666664 | 2.51 |
| 44913.958333333336 | 2.61 |
| 44913.96875 | 2.63 |
| 44913.979166666664 | 2.8 |
| 44913.989583333336 | 2.91 |
| 44914.0 | 2.97 |
| 44914.010416666664 | 3.13 |
| 44914.020833333336 | 3.25 |
| 44914.03125 | 3.43 |
| 44914.041666666664 | 3.85 |
| 44914.052083333336 | 3.97 |
| 44914.0625 | 4.2 |
| 44914.072916666664 | 4.27 |
| 44914.083333333336 | 4.25 |
| 44914.09375 | 4.38 |
| 44914.104166666664 | 4.41 |
| 44914.114583333336 | 4.5 |
| 44914.125 | 4.59 |
| 44914.135416666664 | 4.54 |
| 44914.145833333336 | 4.67 |
| 44914.15625 | 4.14 |
| 44914.166666666664 | 4.22 |
| 44914.177083333336 | 4.17 |
| 44914.1875 | 4 |
| 44914.197916666664 | 4.22 |
| 44914.208333333336 | 3.9 |
| 44914.21875 | 3.84 |
| 44914.229166666664 | 3.61 |
| 44914.239583333336 | 3.54 |
| 44914.25 | 3.52 |
| 44914.260416666664 | 3.62 |
| 44914.270833333336 | 3.25 |
| 44914.28125 | 3.3 |
| 44914.291666666664 | 3.17 |
| 44914.302083333336 | 3.12 |
| 44914.3125 | 3.14 |
| 44914.322916666664 | 3.01 |
| 44914.333333333336 | 3.11 |
| 44914.34375 | 3.06 |
| 44914.354166666664 | 3 |
| 44914.364583333336 | 2.89 |
| 44914.375 | 3.05 |
| 44914.385416666664 | 2.96 |
| 44914.395833333336 | 2.9 |
| 44914.40625 | 2.93 |
| 44914.416666666664 | 2.6 |
| 44914.427083333336 | 2.81 |
| 44914.4375 | 2.98 |
| 44914.447916666664 | 2.84 |
| 44914.458333333336 | 2.76 |
| 44914.46875 | 2.77 |
| 44914.479166666664 | 2.77 |
| 44914.489583333336 | 2.84 |
| 44914.5 | 2.81 |
| 44914.510416666664 | 4.77 |
| 44914.520833333336 | 3.05 |
| 44914.53125 | 3.2 |
| 44914.541666666664 | 3.28 |
| 44914.552083333336 | 3.66 |
| 44914.5625 | 3.55 |
| 44914.572916666664 | 3.64 |
| 44914.583333333336 | 4.06 |
| 44914.59375 | 4.35 |
| 44914.604166666664 | 4.72 |
| 44914.614583333336 | 5.04 |
| 44914.625 | 4.98 |
| 44914.635416666664 | 5.11 |
| 44914.645833333336 | 5.09 |
| 44914.65625 | 5.04 |
| 44914.666666666664 | 5.38 |
| 44914.677083333336 | 5.29 |
| 44914.6875 | 5.2 |
| 44914.697916666664 | 4.91 |
| 44914.708333333336 | 5.17 |
| 44914.71875 | 4.76 |
| 44914.729166666664 | 4.74 |
| 44914.739583333336 | 4.39 |
| 44914.75 | 4.15 |
| 44914.760416666664 | 4.01 |
| 44914.770833333336 | 3.84 |
| 44914.78125 | 3.77 |
| 44914.791666666664 | 3.42 |
| 44914.802083333336 | 3.34 |
| 44914.8125 | 3.31 |
| 44914.822916666664 | 3.2 |
| 44914.833333333336 | 3.07 |
| 44914.84375 | 2.95 |
| 44914.854166666664 | 2.89 |
| 44914.864583333336 | 2.8 |
| 44914.875 | 2.8 |
| 44914.885416666664 | 2.81 |
| 44914.895833333336 | 2.76 |
| 44914.90625 | 2.88 |
| 44914.916666666664 | 2.74 |
| 44914.927083333336 | 2.96 |
| 44914.9375 | 2.88 |
| 44914.947916666664 | 2.98 |
| 44914.958333333336 | 2.83 |
| 44914.96875 | 2.81 |
| 44914.979166666664 | 2.88 |
| 44914.989583333336 | 2.91 |
| 44915.0 | 3 |
| 44915.010416666664 | 3.14 |
| 44915.020833333336 | 3.03 |
| 44915.03125 | 3.21 |
| 44915.041666666664 | 3.51 |
| 44915.052083333336 | 4.11 |
| 44915.0625 | 4.36 |
| 44915.072916666664 | 4.59 |
| 44915.083333333336 | 4.86 |
| 44915.09375 | 4.91 |
| 44915.104166666664 | 4.95 |
| 44915.114583333336 | 5.05 |
| 44915.125 | 5.06 |
| 44915.135416666664 | 5.08 |
| 44915.145833333336 | 5 |
| 44915.15625 | 5.17 |
| 44915.166666666664 | 5.13 |
| 44915.177083333336 | 5.03 |
| 44915.1875 | 5.45 |
| 44915.197916666664 | 4.86 |
| 44915.208333333336 | 4.89 |
| 44915.21875 | 4.73 |
| 44915.229166666664 | 4.43 |
| 44915.239583333336 | 4.28 |
| 44915.25 | 3.78 |
| 44915.260416666664 | 3.55 |
| 44915.270833333336 | 3.47 |
| 44915.28125 | 3.44 |
| 44915.291666666664 | 3.47 |
| 44915.302083333336 | 3.41 |
| 44915.3125 | 3.29 |
| 44915.322916666664 | 3.22 |
| 44915.333333333336 | 3.23 |
| 44915.34375 | 3.25 |
| 44915.354166666664 | 3.26 |
| 44915.364583333336 | 3.23 |
| 44915.375 | 3.31 |
| 44915.385416666664 | 3.29 |
| 44915.395833333336 | 3.2 |
| 44915.40625 | 3.17 |
| 44915.416666666664 | 3.07 |
| 44915.427083333336 | 2.99 |
| 44915.4375 | 3.06 |
| 44915.447916666664 | 2.92 |
| 44915.458333333336 | 2.98 |
| 44915.46875 | 3.07 |
| 44915.479166666664 | 2.98 |
| 44915.489583333336 | 2.92 |
| 44915.5 | 2.96 |
| 44915.510416666664 | 2.83 |
| 44915.520833333336 | 2.87 |
| 44915.53125 | 2.87 |
| 44915.541666666664 | 3.05 |
| 44915.552083333336 | 3.01 |
| 44915.5625 | 3.07 |
| 44915.572916666664 | 3.18 |
| 44915.583333333336 | 3.19 |
| 44915.59375 | 3.31 |
| 44915.604166666664 | 3.48 |
| 44915.614583333336 | 3.53 |
| 44915.625 | 4.6 |
| 44915.635416666664 | 4.57 |
| 44915.645833333336 | 5.07 |
| 44915.65625 | 5.28 |
| 44915.666666666664 | 5.33 |
| 44915.677083333336 | 5.23 |
| 44915.6875 | 5.38 |
| 44915.697916666664 | 5.47 |
| 44915.708333333336 | 5.64 |
| 44915.71875 | 5.44 |
| 44915.729166666664 | 5 |
| 44915.739583333336 | 5.45 |
| 44915.75 | 5.86 |
| 44915.760416666664 | 5.27 |
| 44915.770833333336 | 5.05 |
| 44915.78125 | 4.87 |
| 44915.791666666664 | 4.63 |
| 44915.802083333336 | 4.29 |
| 44915.8125 | 3.91 |
| 44915.822916666664 | 3.94 |
| 44915.833333333336 | 3.77 |
| 44915.84375 | 3.8 |
| 44915.854166666664 | 3.57 |
| 44915.864583333336 | 3.42 |
| 44915.875 | 3.28 |
| 44915.885416666664 | 3.22 |
| 44915.895833333336 | 3.2 |
| 44915.90625 | 3.2 |
| 44915.916666666664 | 3.19 |
| 44915.927083333336 | 3.12 |
| 44915.9375 | 3.21 |
| 44915.947916666664 | 3.22 |
| 44915.958333333336 | 3.22 |
| 44915.96875 | 3.15 |
| 44915.979166666664 | 3.08 |
| 44915.989583333336 | 3.09 |
| 44916.0 | 3.11 |
| 44916.010416666664 | 3.18 |
| 44916.020833333336 | 3.24 |
| 44916.03125 | 3.48 |
| 44916.041666666664 | 3.23 |
| 44916.052083333336 | 3.48 |
| 44916.0625 | 3.6 |
| 44916.072916666664 | 3.88 |
| 44916.083333333336 | 4.06 |
| 44916.09375 | 4.53 |
| 44916.104166666664 | 4.77 |
| 44916.114583333336 | 4.79 |
| 44916.125 | 4.93 |
| 44916.135416666664 | 5.02 |
| 44916.145833333336 | 5.03 |
| 44916.15625 | 5.14 |
| 44916.166666666664 | 5.04 |
| 44916.177083333336 | 5.33 |
| 44916.1875 | 5.46 |
| 44916.197916666664 | 5.04 |
| 44916.208333333336 | 5.16 |
| 44916.21875 | 4.97 |
| 44916.229166666664 | 5.03 |
| 44916.239583333336 | 4.83 |
| 44916.25 | 4.7 |
| 44916.260416666664 | 4.39 |
| 44916.270833333336 | 4.33 |
| 44916.28125 | 4 |
| 44916.291666666664 | 3.93 |
| 44916.302083333336 | 3.55 |
| 44916.3125 | 3.46 |
| 44916.322916666664 | 3.39 |
| 44916.333333333336 | 3.24 |
| 44916.34375 | 3.28 |
| 44916.354166666664 | 3.18 |
| 44916.364583333336 | 3.28 |
| 44916.375 | 3.26 |
| 44916.385416666664 | 3.33 |
| 44916.395833333336 | 3.39 |
| 44916.40625 | 3.46 |
| 44916.416666666664 | 3.45 |
| 44916.427083333336 | 3.34 |
| 44916.4375 | 3.29 |
| 44916.447916666664 | 3.24 |
| 44916.458333333336 | 3.06 |
| 44916.46875 | 3.26 |
| 44916.479166666664 | 3.19 |
| 44916.489583333336 | 3.16 |
| 44916.5 | 2.92 |
| 44916.510416666664 | 3.07 |
| 44916.520833333336 | 3.07 |
| 44916.53125 | 3.02 |
| 44916.541666666664 | 2.92 |
| 44916.552083333336 | 2.98 |
| 44916.5625 | 2.88 |
| 44916.572916666664 | 2.86 |
| 44916.583333333336 | 2.96 |
| 44916.59375 | 3 |
| 44916.604166666664 | 2.94 |
| 44916.614583333336 | 3.26 |
| 44916.625 | 3.1 |
| 44916.635416666664 | 3.31 |
| 44916.645833333336 | 3.6 |
| 44916.65625 | 3.52 |
| 44916.666666666664 | 4.62 |
| 44916.677083333336 | 4.93 |
| 44916.6875 | 5.85 |
| 44916.697916666664 | 5.65 |
| 44916.708333333336 | 5.36 |
| 44916.71875 | 5.51 |
| 44916.729166666664 | 5.56 |
| 44916.739583333336 | 5.4 |
| 44916.75 | 5.36 |
| 44916.760416666664 | 5.13 |
| 44916.770833333336 | 4.93 |
| 44916.78125 | 4.87 |
| 44916.791666666664 | 4.82 |
| 44916.802083333336 | 4.59 |
| 44916.8125 | 4.8 |
| 44916.822916666664 | 4.45 |
| 44916.833333333336 | 4.38 |
| 44916.84375 | 4.09 |
| 44916.854166666664 | 3.84 |
| 44916.864583333336 | 3.77 |
| 44916.875 | 3.66 |
| 44916.885416666664 | 3.44 |
| 44916.895833333336 | 3.4 |
| 44916.90625 | 3.27 |
| 44916.916666666664 | 3.21 |
| 44916.927083333336 | 3.27 |
| 44916.9375 | 3.29 |
| 44916.947916666664 | 3.26 |
| 44916.958333333336 | 3.28 |
| 44916.96875 | 3.63 |
| 44916.979166666664 | 3.25 |
| 44916.989583333336 | 3.4 |
| 44917.0 | 3.25 |
| 44917.010416666664 | 3.29 |
| 44917.020833333336 | 3.19 |
| 44917.03125 | 3.12 |
| 44917.041666666664 | 3.2 |
| 44917.052083333336 | 3.09 |
| 44917.0625 | 3.07 |
| 44917.072916666664 | 3.14 |
| 44917.083333333336 | 3.31 |
| 44917.09375 | 3.26 |
| 44917.104166666664 | 3.31 |
| 44917.114583333336 | 3.51 |
| 44917.125 | 3.66 |
| 44917.135416666664 | 3.77 |
| 44917.145833333336 | 3.82 |
| 44917.15625 | 4.27 |
| 44917.166666666664 | 4.62 |
| 44917.177083333336 | 4.73 |
| 44917.1875 | 4.93 |
| 44917.197916666664 | 4.9 |
| 44917.208333333336 | 4.85 |
| 44917.21875 | 4.64 |
| 44917.229166666664 | 4.71 |
| 44917.239583333336 | 4.64 |
| 44917.25 | 5.21 |
| 44917.260416666664 | 4.59 |
| 44917.270833333336 | 4.55 |
| 44917.28125 | 4.53 |
| 44917.291666666664 | 4.54 |
| 44917.302083333336 | 4.35 |
| 44917.3125 | 4.32 |
| 44917.322916666664 | 3.75 |
| 44917.333333333336 | 3.74 |
| 44917.34375 | 3.66 |
| 44917.354166666664 | 3.6 |
| 44917.364583333336 | 3.47 |
| 44917.375 | 3.45 |
| 44917.385416666664 | 3.51 |
| 44917.395833333336 | 3.67 |
| 44917.40625 | 3.78 |
| 44917.416666666664 | 3.59 |
| 44917.427083333336 | 3.65 |
| 44917.4375 | 3.57 |
| 44917.447916666664 | 3.59 |
| 44917.458333333336 | 3.31 |
| 44917.46875 | 3.45 |
| 44917.479166666664 | 3.44 |
| 44917.489583333336 | 3.36 |
| 44917.5 | 3.49 |
| 44917.510416666664 | 3.43 |
| 44917.520833333336 | 3.3 |
| 44917.53125 | 3.5 |
| 44917.541666666664 | 5.09 |
| 44917.552083333336 | 3.21 |
| 44917.5625 | 3.34 |
| 44917.572916666664 | 3.21 |
| 44917.583333333336 | 3.05 |
| 44917.59375 | 3.05 |
| 44917.604166666664 | 3.04 |
| 44917.614583333336 | 3.02 |
| 44917.625 | 3.04 |
| 44917.635416666664 | 3.02 |
| 44917.645833333336 | 3.05 |
| 44917.65625 | 3.25 |
| 44917.666666666664 | 3.22 |
| 44917.677083333336 | 3.27 |
| 44917.6875 | 3.44 |
| 44917.697916666664 | 3.55 |
| 44917.708333333336 | 4.18 |
| 44917.71875 | 4.22 |
| 44917.729166666664 | 5.02 |
| 44917.739583333336 | 6.42 |
| 44917.75 | 6.37 |
| 44917.760416666664 | 6.61 |
| 44917.770833333336 | 6.73 |
| 44917.78125 | 6.12 |
| 44917.791666666664 | 5.76 |
| 44917.802083333336 | 5.87 |
| 44917.8125 | 5.2 |
| 44917.822916666664 | 5.19 |
| 44917.833333333336 | 5.35 |
| 44917.84375 | 5.4 |
| 44917.854166666664 | 5.23 |
| 44917.864583333336 | 4.9 |
| 44917.875 | 5.04 |
| 44917.885416666664 | 4.77 |
| 44917.895833333336 | 4.78 |
| 44917.90625 | 5.27 |
| 44917.916666666664 | 5.58 |
| 44917.927083333336 | 5.55 |
| 44917.9375 | 5.73 |
| 44917.947916666664 | 5.66 |
| 44917.958333333336 | 5.96 |
| 44917.96875 | 5.71 |
| 44917.979166666664 | 5.5 |
| 44917.989583333336 | 5.18 |
| 44918.0 | 5.08 |
| 44918.010416666664 | 4.92 |
| 44918.020833333336 | 4.77 |
| 44918.03125 | 4.77 |
| 44918.041666666664 | 4.57 |
| 44918.052083333336 | 4.55 |
| 44918.0625 | 5.73 |
| 44918.072916666664 | 4.6 |
| 44918.083333333336 | 5.03 |
| 44918.09375 | 4.91 |
| 44918.104166666664 | 4.34 |
| 44918.114583333336 | 4.57 |
| 44918.125 | 4.94 |
| 44918.135416666664 | 5.46 |
| 44918.145833333336 | 6.47 |
| 44918.15625 | 6.7 |
| 44918.166666666664 | 7.13 |
| 44918.177083333336 | 8.02 |
| 44918.1875 | 8.36 |
| 44918.197916666664 | 10.13 |
| 44918.208333333336 | 12.2 |
| 44918.21875 | 11.81 |
| 44918.229166666664 | 17.58 |
| 44918.239583333336 | 19.36 |
| 44918.25 | 17.7 |
| 44918.260416666664 | 19.26 |
| 44918.270833333336 | 17.47 |
| 44918.28125 | 18.29 |
| 44918.291666666664 | 14.93 |
| 44918.302083333336 | 13.37 |
| 44918.3125 | 11.77 |
| 44918.322916666664 | 12.7 |
| 44918.333333333336 | 13.17 |
| 44918.34375 | 12.4 |
| 44918.354166666664 | 14.85 |
| 44918.364583333336 | 15.31 |
| 44918.375 | 15.71 |
| 44918.385416666664 | 15.86 |
| 44918.395833333336 | 18.07 |
| 44918.40625 | 21.33 |
| 44918.416666666664 | 23.95 |
| 44918.427083333336 | 30.17 |
| 44918.4375 | 28.89 |
| 44918.447916666664 | 25.26 |
| 44918.458333333336 | 23.55 |
| 44918.46875 | 21.25 |
| 44918.479166666664 | 18.28 |
| 44918.489583333336 | 16.15 |
| 44918.5 | 15.38 |
| 44918.510416666664 | 13.74 |
| 44918.520833333336 | 13.36 |
| 44918.53125 | 11.73 |
| 44918.541666666664 | 10.91 |
| 44918.552083333336 | 10.46 |
| 44918.5625 | 9.69 |
| 44918.572916666664 | 9.16 |
| 44918.583333333336 | 9.41 |
| 44918.59375 | 8.76 |
| 44918.604166666664 | 8.13 |
| 44918.614583333336 | 8.66 |
| 44918.625 | 8.24 |
| 44918.635416666664 | 8.2 |
| 44918.645833333336 | 8.6 |
| 44918.65625 | 8.41 |
| 44918.666666666664 | 9.64 |
| 44918.677083333336 | 9.72 |
| 44918.6875 | 10.26 |
| 44918.697916666664 | 10.21 |
| 44918.708333333336 | 12.61 |
| 44918.71875 | 13.42 |
| 44918.729166666664 | 16.79 |
| 44918.739583333336 | 20.65 |
| 44918.75 | 23.85 |
| 44918.760416666664 | 33.98 |
| 44918.770833333336 | 35.42 |
| 44918.78125 | 37.84 |
| 44918.791666666664 | 42.79 |
| 44918.802083333336 | 45.56 |
| 44918.8125 | 33.15 |
| 44918.822916666664 | 39.95 |
| 44918.833333333336 | 32.02 |
| 44918.84375 | 24.91 |
| 44918.854166666664 | 21.24 |
| 44918.864583333336 | 20.52 |
| 44918.875 | 19.88 |
| 44918.885416666664 | 18.31 |
| 44918.895833333336 | 23.14 |
| 44918.90625 | 38.98 |
| 44918.916666666664 | 35.27 |
| 44918.927083333336 | 32.77 |
| 44918.9375 | 36.93 |
| 44918.947916666664 | 33.71 |
| 44918.958333333336 | 37.22 |
| 44918.96875 | 44.5 |
| 44918.979166666664 | 46.96 |
| 44918.989583333336 | 54.13 |
| 44919.0 | 59.4 |
| 44919.010416666664 | 59.86 |
| 44919.020833333336 | 56.17 |
| 44919.03125 | 50.55 |
| 44919.041666666664 | 46.34 |
| 44919.052083333336 | 35.6 |
| 44919.0625 | 30.39 |
| 44919.072916666664 | 27.3 |
| 44919.083333333336 | 19.77 |
| 44919.09375 | 19.78 |
| 44919.104166666664 | 26.56 |
| 44919.114583333336 | 28.36 |
| 44919.125 | 34.8 |
| 44919.135416666664 | 55.47 |
| 44919.145833333336 | 61.47 |
| 44919.15625 | 34.76 |
| 44919.166666666664 | 36.5 |
| 44919.177083333336 | 29.94 |
| 44919.1875 | 22.08 |
| 44919.197916666664 | 20.2 |
| 44919.208333333336 | 19.31 |
| 44919.21875 | 19.47 |
| 44919.229166666664 | 27.94 |
| 44919.239583333336 | 21.85 |
| 44919.25 | 20.39 |
| 44919.260416666664 | 18.33 |
| 44919.270833333336 | 18.78 |
| 44919.28125 | 19.74 |
| 44919.291666666664 | 19.38 |
| 44919.302083333336 | 25.9 |
| 44919.3125 | 23.16 |
| 44919.322916666664 | 19.25 |
| 44919.333333333336 | 16.77 |
| 44919.34375 | 15.64 |
| 44919.354166666664 | 15.64 |
| 44919.364583333336 | 15.58 |
| 44919.375 | 15.93 |
| 44919.385416666664 | 20.3 |
| 44919.395833333336 | 41.49 |
| 44919.40625 | 63.23 |
| 44919.416666666664 | 64.03 |
| 44919.427083333336 | 60.11 |
| 44919.4375 | 55.4 |
| 44919.447916666664 | 48.71 |
| 44919.458333333336 | 49.89 |
| 44919.46875 | 54.59 |
| 44919.479166666664 | 52.35 |
| 44919.489583333336 | 47.79 |
| 44919.5 | 44.53 |
| 44919.510416666664 | 41.3 |
| 44919.520833333336 | 40.47 |
| 44919.53125 | 38.33 |
| 44919.541666666664 | 37.44 |
| 44919.552083333336 | 38.18 |
| 44919.5625 | 38.9 |
| 44919.572916666664 | 35.92 |
| 44919.583333333336 | 32.96 |
| 44919.59375 | 27.08 |
| 44919.604166666664 | 26.45 |
| 44919.614583333336 | 20.3 |
| 44919.625 | 18.86 |
| 44919.635416666664 | 17.73 |
| 44919.645833333336 | 16.99 |
| 44919.65625 | 17.87 |
| 44919.666666666664 | 26.09 |
| 44919.677083333336 | 18.9 |
| 44919.6875 | 19.05 |
| 44919.697916666664 | 22.77 |
| 44919.708333333336 | 23.1 |
| 44919.71875 | 27.48 |
| 44919.729166666664 | 29.53 |
| 44919.739583333336 | 33.44 |
| 44919.75 | 40.72 |
| 44919.760416666664 | 42.01 |
| 44919.770833333336 | 35.88 |
| 44919.78125 | 33.94 |
| 44919.791666666664 | 34.05 |
| 44919.802083333336 | 32.94 |
| 44919.8125 | 30.98 |
| 44919.822916666664 | 29.96 |
| 44919.833333333336 | 27.58 |
| 44919.84375 | 24.72 |
| 44919.854166666664 | 32.71 |
| 44919.864583333336 | 21.76 |
| 44919.875 | 19.23 |
| 44919.885416666664 | 19.35 |
| 44919.895833333336 | 18.54 |
| 44919.90625 | 16.86 |
| 44919.916666666664 | 17.49 |
| 44919.927083333336 | 21.64 |
| 44919.9375 | 31.43 |
| 44919.947916666664 | 36.98 |
| 44919.958333333336 | 39.76 |
| 44919.96875 | 36.35 |
| 44919.979166666664 | 32.48 |
| 44919.989583333336 | 31.15 |
| 44920.0 | 28.48 |
| 44920.010416666664 | 25.72 |
| 44920.020833333336 | 24.22 |
| 44920.03125 | 22.85 |
| 44920.041666666664 | 20.37 |
| 44920.052083333336 | 19.65 |
| 44920.0625 | 18.2 |
| 44920.072916666664 | 17.01 |
| 44920.083333333336 | 16.1 |
| 44920.09375 | 16.46 |
| 44920.104166666664 | 15.01 |
| 44920.114583333336 | 13.3 |
| 44920.125 | 13.59 |
| 44920.135416666664 | 12.67 |
| 44920.145833333336 | 11.39 |
| 44920.15625 | 12.22 |
| 44920.166666666664 | 13.59 |
| 44920.177083333336 | 14.21 |
| 44920.1875 | 16.64 |
| 44920.197916666664 | 17 |
| 44920.208333333336 | 20.78 |
| 44920.21875 | 23.24 |
| 44920.229166666664 | 21.31 |
| 44920.239583333336 | 18.37 |
| 44920.25 | 18.78 |
| 44920.260416666664 | 17.83 |
| 44920.270833333336 | 17.05 |
| 44920.28125 | 17.05 |
| 44920.291666666664 | 17 |
| 44920.302083333336 | 15.28 |
| 44920.3125 | 14.97 |
| 44920.322916666664 | 14.51 |
| 44920.333333333336 | 13.99 |
| 44920.34375 | 13.2 |
| 44920.354166666664 | 12.59 |
| 44920.364583333336 | 12.67 |
| 44920.375 | 12.15 |
| 44920.385416666664 | 11.89 |
| 44920.395833333336 | 12.36 |
| 44920.40625 | 12.67 |
| 44920.416666666664 | 13.12 |
| 44920.427083333336 | 15.92 |
| 44920.4375 | 16.77 |
| 44920.447916666664 | 20.85 |
| 44920.458333333336 | 19.78 |
| 44920.46875 | 20.18 |
| 44920.479166666664 | 16.74 |
| 44920.489583333336 | 14.41 |
| 44920.5 | 12.82 |
| 44920.510416666664 | 12.07 |
| 44920.520833333336 | 12.01 |
| 44920.53125 | 12.76 |
| 44920.541666666664 | 12.63 |
| 44920.552083333336 | 12.93 |
| 44920.5625 | 13.39 |
| 44920.572916666664 | 12.94 |
| 44920.583333333336 | 13.42 |
| 44920.59375 | 14.07 |
| 44920.604166666664 | 13.75 |
| 44920.614583333336 | 13.79 |
| 44920.625 | 12.75 |
| 44920.635416666664 | 12.54 |
| 44920.645833333336 | 11.24 |
| 44920.65625 | 10.94 |
| 44920.666666666664 | 10.06 |
| 44920.677083333336 | 9.84 |
| 44920.6875 | 9.37 |
| 44920.697916666664 | 9.79 |
| 44920.708333333336 | 9.86 |
| 44920.71875 | 10.39 |
| 44920.729166666664 | 12.94 |
| 44920.739583333336 | 11.49 |
| 44920.75 | 12.81 |
| 44920.760416666664 | 15.11 |
| 44920.770833333336 | 14.08 |
| 44920.78125 | 19.65 |
| 44920.791666666664 | 17.36 |
| 44920.802083333336 | 20.85 |
| 44920.8125 | 18.5 |
| 44920.822916666664 | 21.09 |
| 44920.833333333336 | 19.51 |
| 44920.84375 | 18.91 |
| 44920.854166666664 | 18.16 |
| 44920.864583333336 | 18.6 |
| 44920.875 | 16.82 |
| 44920.885416666664 | 15.43 |
| 44920.895833333336 | 13.71 |
| 44920.90625 | 13.36 |
| 44920.916666666664 | 12.6 |
| 44920.927083333336 | 13.71 |
| 44920.9375 | 12.4 |
| 44920.947916666664 | 12.33 |
| 44920.958333333336 | 13.78 |
| 44920.96875 | 14.67 |
| 44920.979166666664 | 14 |
| 44920.989583333336 | 13.35 |
| 44921.0 | 13.59 |
| 44921.010416666664 | 13.73 |
| 44921.020833333336 | 12.27 |
| 44921.03125 | 10.87 |
| 44921.041666666664 | 10.45 |
| 44921.052083333336 | 9.63 |
| 44921.0625 | 9.13 |
| 44921.072916666664 | 9.41 |
| 44921.083333333336 | 9.16 |
| 44921.09375 | 8.9 |
| 44921.104166666664 | 8.78 |
| 44921.114583333336 | 8.54 |
| 44921.125 | 8.42 |
| 44921.135416666664 | 7.82 |
| 44921.145833333336 | 8.63 |
| 44921.15625 | 7.6 |
| 44921.166666666664 | 7.79 |
| 44921.177083333336 | 7.54 |
| 44921.1875 | 7.52 |
| 44921.197916666664 | 7.52 |
| 44921.208333333336 | 8.06 |
| 44921.21875 | 8.39 |
| 44921.229166666664 | 9.33 |
| 44921.239583333336 | 8.73 |
| 44921.25 | 12.6 |
| 44921.260416666664 | 14.22 |
| 44921.270833333336 | 14.01 |
| 44921.28125 | 13.58 |
| 44921.291666666664 | 13.54 |
| 44921.302083333336 | 14.49 |
| 44921.3125 | 13.99 |
| 44921.322916666664 | 12.48 |
| 44921.333333333336 | 12.78 |
| 44921.34375 | 12.82 |
| 44921.354166666664 | 11.77 |
| 44921.364583333336 | 10.85 |
| 44921.375 | 11.17 |
| 44921.385416666664 | 9.34 |
| 44921.395833333336 | 9.13 |
| 44921.40625 | 9.02 |
| 44921.416666666664 | 9.25 |
| 44921.427083333336 | 9.82 |
| 44921.4375 | 10.34 |
| 44921.447916666664 | 10.24 |
| 44921.458333333336 | 11.54 |
| 44921.46875 | 11.39 |
| 44921.479166666664 | 11.14 |
| 44921.489583333336 | 11.56 |
| 44921.5 | 10.81 |
| 44921.510416666664 | 9.59 |
| 44921.520833333336 | 8.8 |
| 44921.53125 | 8.06 |
| 44921.541666666664 | 7.92 |
| 44921.552083333336 | 9.01 |
| 44921.5625 | 8.66 |
| 44921.572916666664 | 8.68 |
| 44921.583333333336 | 8.52 |
| 44921.59375 | 8.3 |
| 44921.604166666664 | 9.11 |
| 44921.614583333336 | 9.15 |
| 44921.625 | 8.63 |
| 44921.635416666664 | 8.28 |
| 44921.645833333336 | 8.17 |
| 44921.65625 | 7.69 |
| 44921.666666666664 | 7.24 |
| 44921.677083333336 | 7.81 |
| 44921.6875 | 7.31 |
| 44921.697916666664 | 6.94 |
| 44921.708333333336 | 6.78 |
| 44921.71875 | 6.6 |
| 44921.729166666664 | 6.54 |
| 44921.739583333336 | 6.65 |
| 44921.75 | 7.02 |
| 44921.760416666664 | 7.13 |
| 44921.770833333336 | 7.43 |
| 44921.78125 | 10.86 |
| 44921.791666666664 | 9.69 |
| 44921.802083333336 | 9.39 |
| 44921.8125 | 11.11 |
| 44921.822916666664 | 12.95 |
| 44921.833333333336 | 12.97 |
| 44921.84375 | 13.49 |
| 44921.854166666664 | 13.55 |
| 44921.864583333336 | 16.31 |
| 44921.875 | 15.42 |
| 44921.885416666664 | 13.66 |
| 44921.895833333336 | 12.63 |
| 44921.90625 | 12.95 |
| 44921.916666666664 | 10.62 |
| 44921.927083333336 | 11.53 |
| 44921.9375 | 10.53 |
| 44921.947916666664 | 10.58 |
| 44921.958333333336 | 11.2 |
| 44921.96875 | 11.64 |
| 44921.979166666664 | 11.84 |
| 44921.989583333336 | 11.2 |
| 44922.0 | 11.49 |
| 44922.010416666664 | 10.56 |
| 44922.020833333336 | 10.07 |
| 44922.03125 | 8.42 |
| 44922.041666666664 | 7.98 |
| 44922.052083333336 | 7.77 |
| 44922.0625 | 7.76 |
| 44922.072916666664 | 7.41 |
| 44922.083333333336 | 6.55 |
| 44922.09375 | 6.74 |
| 44922.104166666664 | 6.34 |
| 44922.114583333336 | 6.43 |
| 44922.125 | 6.53 |
| 44922.135416666664 | 6.31 |
| 44922.145833333336 | 6.46 |
| 44922.15625 | 6.16 |
| 44922.166666666664 | 6.37 |
| 44922.177083333336 | 6.2 |
| 44922.1875 | 6.31 |
| 44922.197916666664 | 5.81 |
| 44922.208333333336 | 6.22 |
| 44922.21875 | 5.97 |
| 44922.229166666664 | 6.13 |
| 44922.239583333336 | 6.15 |
| 44922.25 | 6.09 |
| 44922.260416666664 | 6.17 |
| 44922.270833333336 | 6.71 |
| 44922.28125 | 7.87 |
| 44922.291666666664 | 9.68 |
| 44922.302083333336 | 9.05 |
| 44922.3125 | 10.23 |
| 44922.322916666664 | 10.83 |
| 44922.333333333336 | 10.75 |
| 44922.34375 | 10.45 |
| 44922.354166666664 | 11.28 |
| 44922.364583333336 | 11.24 |
| 44922.375 | 9.65 |
| 44922.385416666664 | 11.99 |
| 44922.395833333336 | 10.71 |
| 44922.40625 | 9.55 |
| 44922.416666666664 | 10.17 |
| 44922.427083333336 | 9.89 |
| 44922.4375 | 9.06 |
| 44922.447916666664 | 8.38 |
| 44922.458333333336 | 8.93 |
| 44922.46875 | 9.02 |
| 44922.479166666664 | 9.16 |
| 44922.489583333336 | 9.52 |
| 44922.5 | 9.74 |
| 44922.510416666664 | 9.03 |
| 44922.520833333336 | 8.73 |
| 44922.53125 | 7.74 |
| 44922.541666666664 | 7.2 |
| 44922.552083333336 | 6.64 |
| 44922.5625 | 6.29 |
| 44922.572916666664 | 6.01 |
| 44922.583333333336 | 5.81 |
| 44922.59375 | 5.87 |
| 44922.604166666664 | 5.89 |
| 44922.614583333336 | 5.89 |
| 44922.625 | 6.23 |
| 44922.635416666664 | 6.16 |
| 44922.645833333336 | 5.9 |
| 44922.65625 | 5.88 |
| 44922.666666666664 | 5.8 |
| 44922.677083333336 | 5.67 |
| 44922.6875 | 5.72 |
| 44922.697916666664 | 5.78 |
| 44922.708333333336 | 5.67 |
| 44922.71875 | 5.61 |
| 44922.729166666664 | 5.27 |
| 44922.739583333336 | 5.28 |
| 44922.75 | 5.11 |
| 44922.760416666664 | 5.43 |
| 44922.770833333336 | 5.77 |
| 44922.78125 | 5.33 |
| 44922.791666666664 | 5.65 |
| 44922.802083333336 | 5.81 |
| 44922.8125 | 5.82 |
| 44922.822916666664 | 5.83 |
| 44922.833333333336 | 7 |
| 44922.84375 | 7.86 |
| 44922.854166666664 | 7.53 |
| 44922.864583333336 | 7.84 |
| 44922.875 | 9.43 |
| 44922.885416666664 | 9.43 |
| 44922.895833333336 | 9.64 |
| 44922.90625 | 9.28 |
| 44922.916666666664 | 9.06 |
| 44922.927083333336 | 8.56 |
| 44922.9375 | 8.59 |
| 44922.947916666664 | 8.82 |
| 44922.958333333336 | 8.61 |
| 44922.96875 | 8.17 |
| 44922.979166666664 | 7.66 |
| 44922.989583333336 | 7.68 |
| 44923.0 | 7.36 |
| 44923.010416666664 | 7.7 |
| 44923.020833333336 | 8.21 |
| 44923.03125 | 8.53 |
| 44923.041666666664 | 8.3 |
| 44923.052083333336 | 7.96 |
| 44923.0625 | 7.46 |
| 44923.072916666664 | 7 |
| 44923.083333333336 | 6.65 |
| 44923.09375 | 6.41 |
| 44923.104166666664 | 5.98 |
| 44923.114583333336 | 5.72 |
| 44923.125 | 5.96 |
| 44923.135416666664 | 5.87 |
| 44923.145833333336 | 5.52 |
| 44923.15625 | 5.49 |
| 44923.166666666664 | 5.48 |
| 44923.177083333336 | 5.41 |
| 44923.1875 | 5.35 |
| 44923.197916666664 | 5.19 |
| 44923.208333333336 | 5.26 |
| 44923.21875 | 5.08 |
| 44923.229166666664 | 5.25 |
| 44923.239583333336 | 5.1 |
| 44923.25 | 5.1 |
| 44923.260416666664 | 5.38 |
| 44923.270833333336 | 5.01 |
| 44923.28125 | 5.02 |
| 44923.291666666664 | 5.02 |
| 44923.302083333336 | 5.13 |
| 44923.3125 | 5.23 |
| 44923.322916666664 | 6.08 |
| 44923.333333333336 | 7.56 |
| 44923.34375 | 6.69 |
| 44923.354166666664 | 7.65 |
| 44923.364583333336 | 7.5 |
| 44923.375 | 7.35 |
| 44923.385416666664 | 6.96 |
| 44923.395833333336 | 7.14 |
| 44923.40625 | 7.21 |
| 44923.416666666664 | 7.44 |
| 44923.427083333336 | 7.29 |
| 44923.4375 | 7.47 |
| 44923.447916666664 | 8 |
| 44923.458333333336 | 7.14 |
| 44923.46875 | 7.78 |
| 44923.479166666664 | 7.13 |
| 44923.489583333336 | 6.83 |
| 44923.5 | 7.39 |
| 44923.510416666664 | 10.47 |
| 44923.520833333336 | 9.41 |
| 44923.53125 | 8.4 |
| 44923.541666666664 | 7.77 |
| 44923.552083333336 | 7.15 |
| 44923.5625 | 6.4 |
| 44923.572916666664 | 6.14 |
| 44923.583333333336 | 5.88 |
| 44923.59375 | 5.5 |
| 44923.604166666664 | 5.28 |
| 44923.614583333336 | 5.16 |
| 44923.625 | 4.98 |
| 44923.635416666664 | 5.02 |
| 44923.645833333336 | 4.95 |
| 44923.65625 | 4.98 |
| 44923.666666666664 | 4.78 |
| 44923.677083333336 | 4.87 |
| 44923.6875 | 4.83 |
| 44923.697916666664 | 4.69 |
| 44923.708333333336 | 4.87 |
| 44923.71875 | 4.67 |
| 44923.729166666664 | 4.66 |
| 44923.739583333336 | 4.74 |
| 44923.75 | 5.23 |
| 44923.760416666664 | 4.67 |
| 44923.770833333336 | 4.67 |
| 44923.78125 | 4.53 |
| 44923.791666666664 | 4.47 |
| 44923.802083333336 | 4.62 |
| 44923.8125 | 4.91 |
| 44923.822916666664 | 5.09 |
| 44923.833333333336 | 5.37 |
| 44923.84375 | 5.26 |
| 44923.854166666664 | 5.66 |
| 44923.864583333336 | 6.22 |
| 44923.875 | 6.19 |
| 44923.885416666664 | 6.48 |
| 44923.895833333336 | 7.03 |
| 44923.90625 | 6.58 |
| 44923.916666666664 | 7.31 |
| 44923.927083333336 | 6.7 |
| 44923.9375 | 7 |
| 44923.947916666664 | 6.79 |
| 44923.958333333336 | 6.91 |
| 44923.96875 | 7.12 |
| 44923.979166666664 | 7 |
| 44923.989583333336 | 6.46 |
| 44924.0 | 6.93 |
| 44924.010416666664 | 6.65 |
| 44924.020833333336 | 6.09 |
| 44924.03125 | 6.15 |
| 44924.041666666664 | 6.38 |
| 44924.052083333336 | 6.15 |
| 44924.0625 | 6.27 |
| 44924.072916666664 | 6.27 |
| 44924.083333333336 | 6.15 |
| 44924.09375 | 6.01 |
| 44924.104166666664 | 5.94 |
| 44924.114583333336 | 5.64 |
| 44924.125 | 5.24 |
| 44924.135416666664 | 4.91 |
| 44924.145833333336 | 4.9 |
| 44924.15625 | 4.75 |
| 44924.166666666664 | 4.66 |
| 44924.177083333336 | 4.65 |
| 44924.1875 | 4.59 |
| 44924.197916666664 | 4.67 |
| 44924.208333333336 | 4.56 |
| 44924.21875 | 4.63 |
| 44924.229166666664 | 4.69 |
| 44924.239583333336 | 4.44 |
| 44924.25 | 4.39 |
| 44924.260416666664 | 4.3 |
| 44924.270833333336 | 4.46 |
| 44924.28125 | 4.51 |
| 44924.291666666664 | 4.24 |
| 44924.302083333336 | 4.39 |
| 44924.3125 | 4.2 |
| 44924.322916666664 | 4.29 |
| 44924.333333333336 | 4.66 |
| 44924.34375 | 4.77 |
| 44924.354166666664 | 5.06 |
| 44924.364583333336 | 6.29 |
| 44924.375 | 6.79 |
| 44924.385416666664 | 7.79 |
| 44924.395833333336 | 8.51 |
| 44924.40625 | 8.16 |
| 44924.416666666664 | 7.47 |
| 44924.427083333336 | 7.31 |
| 44924.4375 | 7.15 |
| 44924.447916666664 | 6.91 |
| 44924.458333333336 | 7.05 |
| 44924.46875 | 7.28 |
| 44924.479166666664 | 7.39 |
| 44924.489583333336 | 7.53 |
| 44924.5 | 7.39 |
| 44924.510416666664 | 7.36 |
| 44924.520833333336 | 6.99 |
| 44924.53125 | 7 |
| 44924.541666666664 | 6.97 |
| 44924.552083333336 | 7.17 |
| 44924.5625 | 6.97 |
| 44924.572916666664 | 6.92 |
| 44924.583333333336 | 6.62 |
| 44924.59375 | 6.38 |
| 44924.604166666664 | 6.08 |
| 44924.614583333336 | 6.03 |
| 44924.625 | 5.57 |
| 44924.635416666664 | 5.74 |
| 44924.645833333336 | 5.61 |
| 44924.65625 | 5.54 |
| 44924.666666666664 | 5.28 |
| 44924.677083333336 | 5.02 |
| 44924.6875 | 4.69 |
| 44924.697916666664 | 4.71 |
| 44924.708333333336 | 4.5 |
| 44924.71875 | 4.95 |
| 44924.729166666664 | 4.63 |
| 44924.739583333336 | 4.52 |
| 44924.75 | 4.35 |
| 44924.760416666664 | 4.25 |
| 44924.770833333336 | 4.25 |
| 44924.78125 | 4.56 |
| 44924.791666666664 | 4.47 |
| 44924.802083333336 | 4.41 |
| 44924.8125 | 4.46 |
| 44924.822916666664 | 4.22 |
| 44924.833333333336 | 4.24 |
| 44924.84375 | 4.39 |
| 44924.854166666664 | 4.51 |
| 44924.864583333336 | 4.77 |
| 44924.875 | 4.77 |
| 44924.885416666664 | 4.97 |
| 44924.895833333336 | 5.45 |
| 44924.90625 | 5.71 |
| 44924.916666666664 | 6.2 |
| 44924.927083333336 | 6.3 |
| 44924.9375 | 6.46 |
| 44924.947916666664 | 6.07 |
| 44924.958333333336 | 5.97 |
| 44924.96875 | 6.48 |
| 44924.979166666664 | 6.6 |
| 44924.989583333336 | 6.85 |
| 44925.0 | 6.77 |
| 44925.010416666664 | 6.52 |
| 44925.020833333336 | 6.71 |
| 44925.03125 | 6.5 |
| 44925.041666666664 | 6.08 |
| 44925.052083333336 | 5.57 |
| 44925.0625 | 5.71 |
| 44925.072916666664 | 5.76 |
| 44925.083333333336 | 6.01 |
| 44925.09375 | 5.85 |
| 44925.104166666664 | 5.75 |
| 44925.114583333336 | 5.65 |
| 44925.125 | 5.7 |
| 44925.135416666664 | 5.41 |
| 44925.145833333336 | 5.08 |
| 44925.15625 | 4.83 |
| 44925.166666666664 | 4.62 |
| 44925.177083333336 | 4.59 |
| 44925.1875 | 4.47 |
| 44925.197916666664 | 4.46 |
| 44925.208333333336 | 4.54 |
| 44925.21875 | 4.43 |
| 44925.229166666664 | 4.35 |
| 44925.239583333336 | 4.41 |
| 44925.25 | 4.2 |
| 44925.260416666664 | 4.18 |
| 44925.270833333336 | 4.08 |
| 44925.28125 | 4.08 |
| 44925.291666666664 | 4.07 |
| 44925.302083333336 | 4.32 |
| 44925.3125 | 4.21 |
| 44925.322916666664 | 4.17 |
| 44925.333333333336 | 4.06 |
| 44925.34375 | 4.03 |
| 44925.354166666664 | 3.91 |
| 44925.364583333336 | 4.08 |
| 44925.375 | 4.23 |
| 44925.385416666664 | 4.54 |
| 44925.395833333336 | 4.56 |
| 44925.40625 | 4.78 |
| 44925.416666666664 | 4.89 |
| 44925.427083333336 | 6.02 |
| 44925.4375 | 6.11 |
| 44925.447916666664 | 6.37 |
| 44925.458333333336 | 6.11 |
| 44925.46875 | 5.93 |
| 44925.479166666664 | 5.88 |
| 44925.489583333336 | 5.98 |
| 44925.5 | 6.23 |
| 44925.510416666664 | 6.26 |
| 44925.520833333336 | 6.42 |
| 44925.53125 | 6.81 |
| 44925.541666666664 | 6.52 |
| 44925.552083333336 | 5.96 |
| 44925.5625 | 6.23 |
| 44925.572916666664 | 6.44 |
| 44925.583333333336 | 6.58 |
| 44925.59375 | 6.63 |
| 44925.604166666664 | 6.04 |
| 44925.614583333336 | 5.75 |
| 44925.625 | 5.51 |
| 44925.635416666664 | 5.12 |
| 44925.645833333336 | 4.92 |
| 44925.65625 | 4.83 |
| 44925.666666666664 | 4.81 |
| 44925.677083333336 | 4.62 |
| 44925.6875 | 4.46 |
| 44925.697916666664 | 4.2 |
| 44925.708333333336 | 4.06 |
| 44925.71875 | 4.09 |
| 44925.729166666664 | 4.05 |
| 44925.739583333336 | 4.24 |
| 44925.75 | 3.89 |
| 44925.760416666664 | 3.86 |
| 44925.770833333336 | 3.85 |
| 44925.78125 | 4.09 |
| 44925.791666666664 | 3.97 |
| 44925.802083333336 | 3.84 |
| 44925.8125 | 4.16 |
| 44925.822916666664 | 4.15 |
| 44925.833333333336 | 4.12 |
| 44925.84375 | 3.96 |
| 44925.854166666664 | 4.03 |
| 44925.864583333336 | 3.83 |
| 44925.875 | 3.79 |
| 44925.885416666664 | 3.95 |
| 44925.895833333336 | 3.98 |
| 44925.90625 | 4 |
| 44925.916666666664 | 4.1 |
| 44925.927083333336 | 3.86 |
| 44925.9375 | 4.08 |
| 44925.947916666664 | 4.26 |
| 44925.958333333336 | 4.37 |
| 44925.96875 | 4.69 |
| 44925.979166666664 | 4.83 |
| 44925.989583333336 | 4.69 |
| 44926.0 | 5 |
| 44926.010416666664 | 4.84 |
| 44926.020833333336 | 4.98 |
| 44926.03125 | 5.14 |
| 44926.041666666664 | 5.16 |
| 44926.052083333336 | 5.25 |
| 44926.0625 | 4.95 |
| 44926.072916666664 | 5.07 |
| 44926.083333333336 | 4.72 |
| 44926.09375 | 4.89 |
| 44926.104166666664 | 5.06 |
| 44926.114583333336 | 5.1 |
| 44926.125 | 4.7 |
| 44926.135416666664 | 4.97 |
| 44926.145833333336 | 4.82 |
| 44926.15625 | 4.85 |
| 44926.166666666664 | 4.58 |
| 44926.177083333336 | 4.48 |
| 44926.1875 | 4.01 |
| 44926.197916666664 | 8.04 |
| 44926.208333333336 | 4.24 |
| 44926.21875 | 3.82 |
| 44926.229166666664 | 3.82 |
| 44926.239583333336 | 3.81 |
| 44926.25 | 3.74 |
| 44926.260416666664 | 3.87 |
| 44926.270833333336 | 4.01 |
| 44926.28125 | 3.93 |
| 44926.291666666664 | 4.05 |
| 44926.302083333336 | 3.97 |
| 44926.3125 | 3.84 |
| 44926.322916666664 | 3.76 |
| 44926.333333333336 | 3.79 |
| 44926.34375 | 3.68 |
| 44926.354166666664 | 3.7 |
| 44926.364583333336 | 3.75 |
| 44926.375 | 3.52 |
| 44926.385416666664 | 3.71 |
| 44926.395833333336 | 3.67 |
| 44926.40625 | 3.59 |
| 44926.416666666664 | 3.7 |
| 44926.427083333336 | 3.69 |
| 44926.4375 | 3.96 |
| 44926.447916666664 | 3.92 |
| 44926.458333333336 | 3.92 |
| 44926.46875 | 4.47 |
| 44926.479166666664 | 4.67 |
| 44926.489583333336 | 5.37 |
| 44926.5 | 6.2 |
| 44926.510416666664 | 6.19 |
| 44926.520833333336 | 6.47 |
| 44926.53125 | 7.79 |
| 44926.541666666664 | 8.05 |
| 44926.552083333336 | 8.29 |
| 44926.5625 | 7.61 |
| 44926.572916666664 | 8.22 |
| 44926.583333333336 | 14.63 |
| 44926.59375 | 9.57 |
| 44926.604166666664 | 6.82 |
| 44926.614583333336 | 7.92 |
| 44926.625 | 7.82 |
| 44926.635416666664 | 7.62 |
| 44926.645833333336 | 6.68 |
| 44926.65625 | 7.33 |
| 44926.666666666664 | 6.99 |
| 44926.677083333336 | 6.33 |
| 44926.6875 | 5.77 |
| 44926.697916666664 | 4.92 |
| 44926.708333333336 | 4.59 |
| 44926.71875 | 4.43 |
| 44926.729166666664 | 4.48 |
| 44926.739583333336 | 4.23 |
| 44926.75 | 3.98 |
| 44926.760416666664 | 4.01 |
| 44926.770833333336 | 3.77 |
| 44926.78125 | 3.88 |
| 44926.791666666664 | 3.71 |
| 44926.802083333336 | 3.66 |
| 44926.8125 | 3.66 |
| 44926.822916666664 | 3.68 |
| 44926.833333333336 | 3.61 |
| 44926.84375 | 3.47 |
| 44926.854166666664 | 3.48 |
| 44926.864583333336 | 3.45 |
| 44926.875 | 3.51 |
| 44926.885416666664 | 3.5 |
| 44926.895833333336 | 3.67 |
| 44926.90625 | 3.48 |
| 44926.916666666664 | 3.44 |
| 44926.927083333336 | 3.58 |
| 44926.9375 | 3.65 |
| 44926.947916666664 | 4.35 |
| 44926.958333333336 | 4.58 |
| 44926.96875 | 4.99 |
| 44926.979166666664 | 4.96 |
| 44926.989583333336 | 4.54 |
| 44927.0 | 4.44 |
| 44927.010416666664 | 4.48 |
| 44927.020833333336 | 4.87 |
| 44927.03125 | 5.11 |
| 44927.041666666664 | 16.82 |
| 44927.052083333336 | 15.64 |
| 44927.0625 | 18.6 |
| 44927.072916666664 | 17.23 |
| 44927.083333333336 | 17.48 |
| 44927.09375 | 16.9 |
| 44927.104166666664 | 14.96 |
| 44927.114583333336 | 13.1 |
| 44927.125 | 11.22 |
| 44927.135416666664 | 10.71 |
| 44927.145833333336 | 11.6 |